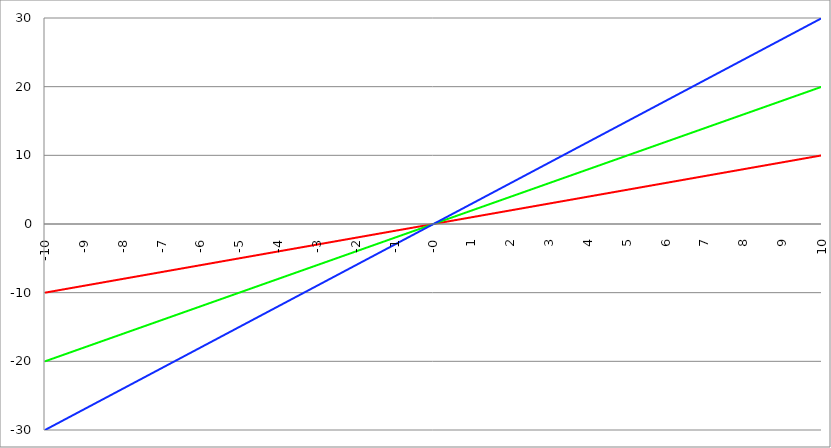
| Category | Series 1 | Series 0 | Series 2 |
|---|---|---|---|
| -10.0 | -10 | -20 | -30 |
| -9.99 | -9.99 | -19.98 | -29.97 |
| -9.98 | -9.98 | -19.96 | -29.94 |
| -9.97 | -9.97 | -19.94 | -29.91 |
| -9.96 | -9.96 | -19.92 | -29.88 |
| -9.95 | -9.95 | -19.9 | -29.85 |
| -9.940000000000001 | -9.94 | -19.88 | -29.82 |
| -9.930000000000001 | -9.93 | -19.86 | -29.79 |
| -9.920000000000002 | -9.92 | -19.84 | -29.76 |
| -9.91 | -9.91 | -19.82 | -29.73 |
| -9.900000000000002 | -9.9 | -19.8 | -29.7 |
| -9.890000000000002 | -9.89 | -19.78 | -29.67 |
| -9.880000000000003 | -9.88 | -19.76 | -29.64 |
| -9.870000000000003 | -9.87 | -19.74 | -29.61 |
| -9.860000000000001 | -9.86 | -19.72 | -29.58 |
| -9.850000000000003 | -9.85 | -19.7 | -29.55 |
| -9.840000000000003 | -9.84 | -19.68 | -29.52 |
| -9.830000000000004 | -9.83 | -19.66 | -29.49 |
| -9.820000000000004 | -9.82 | -19.64 | -29.46 |
| -9.810000000000004 | -9.81 | -19.62 | -29.43 |
| -9.800000000000004 | -9.8 | -19.6 | -29.4 |
| -9.790000000000004 | -9.79 | -19.58 | -29.37 |
| -9.780000000000005 | -9.78 | -19.56 | -29.34 |
| -9.770000000000005 | -9.77 | -19.54 | -29.31 |
| -9.760000000000005 | -9.76 | -19.52 | -29.28 |
| -9.750000000000005 | -9.75 | -19.5 | -29.25 |
| -9.740000000000006 | -9.74 | -19.48 | -29.22 |
| -9.730000000000006 | -9.73 | -19.46 | -29.19 |
| -9.720000000000006 | -9.72 | -19.44 | -29.16 |
| -9.710000000000006 | -9.71 | -19.42 | -29.13 |
| -9.700000000000006 | -9.7 | -19.4 | -29.1 |
| -9.690000000000007 | -9.69 | -19.38 | -29.07 |
| -9.680000000000007 | -9.68 | -19.36 | -29.04 |
| -9.670000000000007 | -9.67 | -19.34 | -29.01 |
| -9.660000000000007 | -9.66 | -19.32 | -28.98 |
| -9.650000000000007 | -9.65 | -19.3 | -28.95 |
| -9.640000000000008 | -9.64 | -19.28 | -28.92 |
| -9.630000000000008 | -9.63 | -19.26 | -28.89 |
| -9.620000000000008 | -9.62 | -19.24 | -28.86 |
| -9.610000000000008 | -9.61 | -19.22 | -28.83 |
| -9.600000000000009 | -9.6 | -19.2 | -28.8 |
| -9.590000000000009 | -9.59 | -19.18 | -28.77 |
| -9.580000000000007 | -9.58 | -19.16 | -28.74 |
| -9.57000000000001 | -9.57 | -19.14 | -28.71 |
| -9.56000000000001 | -9.56 | -19.12 | -28.68 |
| -9.55000000000001 | -9.55 | -19.1 | -28.65 |
| -9.54000000000001 | -9.54 | -19.08 | -28.62 |
| -9.53000000000001 | -9.53 | -19.06 | -28.59 |
| -9.52000000000001 | -9.52 | -19.04 | -28.56 |
| -9.51000000000001 | -9.51 | -19.02 | -28.53 |
| -9.50000000000001 | -9.5 | -19 | -28.5 |
| -9.49000000000001 | -9.49 | -18.98 | -28.47 |
| -9.48000000000001 | -9.48 | -18.96 | -28.44 |
| -9.47000000000001 | -9.47 | -18.94 | -28.41 |
| -9.46000000000001 | -9.46 | -18.92 | -28.38 |
| -9.45000000000001 | -9.45 | -18.9 | -28.35 |
| -9.44000000000001 | -9.44 | -18.88 | -28.32 |
| -9.430000000000012 | -9.43 | -18.86 | -28.29 |
| -9.420000000000012 | -9.42 | -18.84 | -28.26 |
| -9.410000000000013 | -9.41 | -18.82 | -28.23 |
| -9.400000000000013 | -9.4 | -18.8 | -28.2 |
| -9.390000000000011 | -9.39 | -18.78 | -28.17 |
| -9.380000000000013 | -9.38 | -18.76 | -28.14 |
| -9.370000000000013 | -9.37 | -18.74 | -28.11 |
| -9.360000000000014 | -9.36 | -18.72 | -28.08 |
| -9.350000000000014 | -9.35 | -18.7 | -28.05 |
| -9.340000000000014 | -9.34 | -18.68 | -28.02 |
| -9.330000000000014 | -9.33 | -18.66 | -27.99 |
| -9.320000000000014 | -9.32 | -18.64 | -27.96 |
| -9.310000000000015 | -9.31 | -18.62 | -27.93 |
| -9.300000000000013 | -9.3 | -18.6 | -27.9 |
| -9.290000000000015 | -9.29 | -18.58 | -27.87 |
| -9.280000000000015 | -9.28 | -18.56 | -27.84 |
| -9.270000000000016 | -9.27 | -18.54 | -27.81 |
| -9.260000000000016 | -9.26 | -18.52 | -27.78 |
| -9.250000000000014 | -9.25 | -18.5 | -27.75 |
| -9.240000000000016 | -9.24 | -18.48 | -27.72 |
| -9.230000000000016 | -9.23 | -18.46 | -27.69 |
| -9.220000000000017 | -9.22 | -18.44 | -27.66 |
| -9.210000000000017 | -9.21 | -18.42 | -27.63 |
| -9.200000000000017 | -9.2 | -18.4 | -27.6 |
| -9.190000000000017 | -9.19 | -18.38 | -27.57 |
| -9.180000000000017 | -9.18 | -18.36 | -27.54 |
| -9.170000000000018 | -9.17 | -18.34 | -27.51 |
| -9.160000000000016 | -9.16 | -18.32 | -27.48 |
| -9.150000000000018 | -9.15 | -18.3 | -27.45 |
| -9.140000000000018 | -9.14 | -18.28 | -27.42 |
| -9.130000000000019 | -9.13 | -18.26 | -27.39 |
| -9.120000000000019 | -9.12 | -18.24 | -27.36 |
| -9.110000000000017 | -9.11 | -18.22 | -27.33 |
| -9.10000000000002 | -9.1 | -18.2 | -27.3 |
| -9.09000000000002 | -9.09 | -18.18 | -27.27 |
| -9.08000000000002 | -9.08 | -18.16 | -27.24 |
| -9.07000000000002 | -9.07 | -18.14 | -27.21 |
| -9.06000000000002 | -9.06 | -18.12 | -27.18 |
| -9.05000000000002 | -9.05 | -18.1 | -27.15 |
| -9.04000000000002 | -9.04 | -18.08 | -27.12 |
| -9.03000000000002 | -9.03 | -18.06 | -27.09 |
| -9.020000000000021 | -9.02 | -18.04 | -27.06 |
| -9.010000000000021 | -9.01 | -18.02 | -27.03 |
| -9.000000000000021 | -9 | -18 | -27 |
| -8.990000000000022 | -8.99 | -17.98 | -26.97 |
| -8.980000000000022 | -8.98 | -17.96 | -26.94 |
| -8.97000000000002 | -8.97 | -17.94 | -26.91 |
| -8.960000000000022 | -8.96 | -17.92 | -26.88 |
| -8.950000000000022 | -8.95 | -17.9 | -26.85 |
| -8.940000000000023 | -8.94 | -17.88 | -26.82 |
| -8.930000000000023 | -8.93 | -17.86 | -26.79 |
| -8.920000000000023 | -8.92 | -17.84 | -26.76 |
| -8.910000000000023 | -8.91 | -17.82 | -26.73 |
| -8.900000000000023 | -8.9 | -17.8 | -26.7 |
| -8.890000000000024 | -8.89 | -17.78 | -26.67 |
| -8.880000000000024 | -8.88 | -17.76 | -26.64 |
| -8.870000000000024 | -8.87 | -17.74 | -26.61 |
| -8.860000000000024 | -8.86 | -17.72 | -26.58 |
| -8.850000000000025 | -8.85 | -17.7 | -26.55 |
| -8.840000000000025 | -8.84 | -17.68 | -26.52 |
| -8.830000000000025 | -8.83 | -17.66 | -26.49 |
| -8.820000000000025 | -8.82 | -17.64 | -26.46 |
| -8.810000000000025 | -8.81 | -17.62 | -26.43 |
| -8.800000000000026 | -8.8 | -17.6 | -26.4 |
| -8.790000000000026 | -8.79 | -17.58 | -26.37 |
| -8.780000000000026 | -8.78 | -17.56 | -26.34 |
| -8.770000000000026 | -8.77 | -17.54 | -26.31 |
| -8.760000000000026 | -8.76 | -17.52 | -26.28 |
| -8.750000000000027 | -8.75 | -17.5 | -26.25 |
| -8.740000000000027 | -8.74 | -17.48 | -26.22 |
| -8.730000000000027 | -8.73 | -17.46 | -26.19 |
| -8.720000000000027 | -8.72 | -17.44 | -26.16 |
| -8.710000000000027 | -8.71 | -17.42 | -26.13 |
| -8.700000000000028 | -8.7 | -17.4 | -26.1 |
| -8.690000000000028 | -8.69 | -17.38 | -26.07 |
| -8.680000000000028 | -8.68 | -17.36 | -26.04 |
| -8.670000000000028 | -8.67 | -17.34 | -26.01 |
| -8.660000000000029 | -8.66 | -17.32 | -25.98 |
| -8.650000000000029 | -8.65 | -17.3 | -25.95 |
| -8.640000000000029 | -8.64 | -17.28 | -25.92 |
| -8.63000000000003 | -8.63 | -17.26 | -25.89 |
| -8.62000000000003 | -8.62 | -17.24 | -25.86 |
| -8.61000000000003 | -8.61 | -17.22 | -25.83 |
| -8.60000000000003 | -8.6 | -17.2 | -25.8 |
| -8.59000000000003 | -8.59 | -17.18 | -25.77 |
| -8.58000000000003 | -8.58 | -17.16 | -25.74 |
| -8.57000000000003 | -8.57 | -17.14 | -25.71 |
| -8.56000000000003 | -8.56 | -17.12 | -25.68 |
| -8.55000000000003 | -8.55 | -17.1 | -25.65 |
| -8.540000000000031 | -8.54 | -17.08 | -25.62 |
| -8.530000000000031 | -8.53 | -17.06 | -25.59 |
| -8.520000000000032 | -8.52 | -17.04 | -25.56 |
| -8.510000000000032 | -8.51 | -17.02 | -25.53 |
| -8.50000000000003 | -8.5 | -17 | -25.5 |
| -8.490000000000032 | -8.49 | -16.98 | -25.47 |
| -8.480000000000032 | -8.48 | -16.96 | -25.44 |
| -8.470000000000033 | -8.47 | -16.94 | -25.41 |
| -8.460000000000033 | -8.46 | -16.92 | -25.38 |
| -8.450000000000033 | -8.45 | -16.9 | -25.35 |
| -8.440000000000033 | -8.44 | -16.88 | -25.32 |
| -8.430000000000033 | -8.43 | -16.86 | -25.29 |
| -8.420000000000034 | -8.42 | -16.84 | -25.26 |
| -8.410000000000032 | -8.41 | -16.82 | -25.23 |
| -8.400000000000034 | -8.4 | -16.8 | -25.2 |
| -8.390000000000034 | -8.39 | -16.78 | -25.17 |
| -8.380000000000035 | -8.38 | -16.76 | -25.14 |
| -8.370000000000035 | -8.37 | -16.74 | -25.11 |
| -8.360000000000033 | -8.36 | -16.72 | -25.08 |
| -8.350000000000035 | -8.35 | -16.7 | -25.05 |
| -8.340000000000035 | -8.34 | -16.68 | -25.02 |
| -8.330000000000036 | -8.33 | -16.66 | -24.99 |
| -8.320000000000036 | -8.32 | -16.64 | -24.96 |
| -8.310000000000034 | -8.31 | -16.62 | -24.93 |
| -8.300000000000036 | -8.3 | -16.6 | -24.9 |
| -8.290000000000036 | -8.29 | -16.58 | -24.87 |
| -8.280000000000037 | -8.28 | -16.56 | -24.84 |
| -8.270000000000037 | -8.27 | -16.54 | -24.81 |
| -8.260000000000037 | -8.26 | -16.52 | -24.78 |
| -8.250000000000037 | -8.25 | -16.5 | -24.75 |
| -8.240000000000038 | -8.24 | -16.48 | -24.72 |
| -8.230000000000038 | -8.23 | -16.46 | -24.69 |
| -8.220000000000038 | -8.22 | -16.44 | -24.66 |
| -8.210000000000038 | -8.21 | -16.42 | -24.63 |
| -8.200000000000038 | -8.2 | -16.4 | -24.6 |
| -8.190000000000039 | -8.19 | -16.38 | -24.57 |
| -8.180000000000039 | -8.18 | -16.36 | -24.54 |
| -8.170000000000037 | -8.17 | -16.34 | -24.51 |
| -8.16000000000004 | -8.16 | -16.32 | -24.48 |
| -8.15000000000004 | -8.15 | -16.3 | -24.45 |
| -8.14000000000004 | -8.14 | -16.28 | -24.42 |
| -8.13000000000004 | -8.13 | -16.26 | -24.39 |
| -8.12000000000004 | -8.12 | -16.24 | -24.36 |
| -8.11000000000004 | -8.11 | -16.22 | -24.33 |
| -8.10000000000004 | -8.1 | -16.2 | -24.3 |
| -8.09000000000004 | -8.09 | -16.18 | -24.27 |
| -8.08000000000004 | -8.08 | -16.16 | -24.24 |
| -8.07000000000004 | -8.07 | -16.14 | -24.21 |
| -8.06000000000004 | -8.06 | -16.12 | -24.18 |
| -8.05000000000004 | -8.05 | -16.1 | -24.15 |
| -8.040000000000042 | -8.04 | -16.08 | -24.12 |
| -8.03000000000004 | -8.03 | -16.06 | -24.09 |
| -8.020000000000042 | -8.02 | -16.04 | -24.06 |
| -8.010000000000042 | -8.01 | -16.02 | -24.03 |
| -8.000000000000043 | -8 | -16 | -24 |
| -7.990000000000043 | -7.99 | -15.98 | -23.97 |
| -7.980000000000043 | -7.98 | -15.96 | -23.94 |
| -7.970000000000043 | -7.97 | -15.94 | -23.91 |
| -7.960000000000043 | -7.96 | -15.92 | -23.88 |
| -7.950000000000044 | -7.95 | -15.9 | -23.85 |
| -7.940000000000044 | -7.94 | -15.88 | -23.82 |
| -7.930000000000044 | -7.93 | -15.86 | -23.79 |
| -7.920000000000044 | -7.92 | -15.84 | -23.76 |
| -7.910000000000044 | -7.91 | -15.82 | -23.73 |
| -7.900000000000044 | -7.9 | -15.8 | -23.7 |
| -7.890000000000045 | -7.89 | -15.78 | -23.67 |
| -7.880000000000045 | -7.88 | -15.76 | -23.64 |
| -7.870000000000045 | -7.87 | -15.74 | -23.61 |
| -7.860000000000046 | -7.86 | -15.72 | -23.58 |
| -7.850000000000046 | -7.85 | -15.7 | -23.55 |
| -7.840000000000046 | -7.84 | -15.68 | -23.52 |
| -7.830000000000046 | -7.83 | -15.66 | -23.49 |
| -7.820000000000046 | -7.82 | -15.64 | -23.46 |
| -7.810000000000047 | -7.81 | -15.62 | -23.43 |
| -7.800000000000047 | -7.8 | -15.6 | -23.4 |
| -7.790000000000047 | -7.79 | -15.58 | -23.37 |
| -7.780000000000047 | -7.78 | -15.56 | -23.34 |
| -7.770000000000047 | -7.77 | -15.54 | -23.31 |
| -7.760000000000048 | -7.76 | -15.52 | -23.28 |
| -7.750000000000048 | -7.75 | -15.5 | -23.25 |
| -7.740000000000048 | -7.74 | -15.48 | -23.22 |
| -7.730000000000048 | -7.73 | -15.46 | -23.19 |
| -7.720000000000049 | -7.72 | -15.44 | -23.16 |
| -7.710000000000049 | -7.71 | -15.42 | -23.13 |
| -7.700000000000049 | -7.7 | -15.4 | -23.1 |
| -7.690000000000049 | -7.69 | -15.38 | -23.07 |
| -7.680000000000049 | -7.68 | -15.36 | -23.04 |
| -7.67000000000005 | -7.67 | -15.34 | -23.01 |
| -7.66000000000005 | -7.66 | -15.32 | -22.98 |
| -7.65000000000005 | -7.65 | -15.3 | -22.95 |
| -7.64000000000005 | -7.64 | -15.28 | -22.92 |
| -7.63000000000005 | -7.63 | -15.26 | -22.89 |
| -7.620000000000051 | -7.62 | -15.24 | -22.86 |
| -7.610000000000051 | -7.61 | -15.22 | -22.83 |
| -7.600000000000051 | -7.6 | -15.2 | -22.8 |
| -7.590000000000051 | -7.59 | -15.18 | -22.77 |
| -7.580000000000052 | -7.58 | -15.16 | -22.74 |
| -7.570000000000052 | -7.57 | -15.14 | -22.71 |
| -7.560000000000052 | -7.56 | -15.12 | -22.68 |
| -7.550000000000052 | -7.55 | -15.1 | -22.65 |
| -7.540000000000052 | -7.54 | -15.08 | -22.62 |
| -7.530000000000053 | -7.53 | -15.06 | -22.59 |
| -7.520000000000053 | -7.52 | -15.04 | -22.56 |
| -7.510000000000053 | -7.51 | -15.02 | -22.53 |
| -7.500000000000053 | -7.5 | -15 | -22.5 |
| -7.490000000000053 | -7.49 | -14.98 | -22.47 |
| -7.480000000000054 | -7.48 | -14.96 | -22.44 |
| -7.470000000000054 | -7.47 | -14.94 | -22.41 |
| -7.460000000000054 | -7.46 | -14.92 | -22.38 |
| -7.450000000000054 | -7.45 | -14.9 | -22.35 |
| -7.440000000000054 | -7.44 | -14.88 | -22.32 |
| -7.430000000000054 | -7.43 | -14.86 | -22.29 |
| -7.420000000000055 | -7.42 | -14.84 | -22.26 |
| -7.410000000000055 | -7.41 | -14.82 | -22.23 |
| -7.400000000000055 | -7.4 | -14.8 | -22.2 |
| -7.390000000000056 | -7.39 | -14.78 | -22.17 |
| -7.380000000000056 | -7.38 | -14.76 | -22.14 |
| -7.370000000000056 | -7.37 | -14.74 | -22.11 |
| -7.360000000000056 | -7.36 | -14.72 | -22.08 |
| -7.350000000000056 | -7.35 | -14.7 | -22.05 |
| -7.340000000000057 | -7.34 | -14.68 | -22.02 |
| -7.330000000000057 | -7.33 | -14.66 | -21.99 |
| -7.320000000000057 | -7.32 | -14.64 | -21.96 |
| -7.310000000000057 | -7.31 | -14.62 | -21.93 |
| -7.300000000000058 | -7.3 | -14.6 | -21.9 |
| -7.290000000000058 | -7.29 | -14.58 | -21.87 |
| -7.280000000000058 | -7.28 | -14.56 | -21.84 |
| -7.270000000000058 | -7.27 | -14.54 | -21.81 |
| -7.260000000000058 | -7.26 | -14.52 | -21.78 |
| -7.250000000000059 | -7.25 | -14.5 | -21.75 |
| -7.240000000000059 | -7.24 | -14.48 | -21.72 |
| -7.23000000000006 | -7.23 | -14.46 | -21.69 |
| -7.220000000000059 | -7.22 | -14.44 | -21.66 |
| -7.210000000000059 | -7.21 | -14.42 | -21.63 |
| -7.20000000000006 | -7.2 | -14.4 | -21.6 |
| -7.19000000000006 | -7.19 | -14.38 | -21.57 |
| -7.18000000000006 | -7.18 | -14.36 | -21.54 |
| -7.17000000000006 | -7.17 | -14.34 | -21.51 |
| -7.160000000000061 | -7.16 | -14.32 | -21.48 |
| -7.150000000000061 | -7.15 | -14.3 | -21.45 |
| -7.140000000000061 | -7.14 | -14.28 | -21.42 |
| -7.130000000000061 | -7.13 | -14.26 | -21.39 |
| -7.120000000000061 | -7.12 | -14.24 | -21.36 |
| -7.110000000000062 | -7.11 | -14.22 | -21.33 |
| -7.100000000000062 | -7.1 | -14.2 | -21.3 |
| -7.090000000000062 | -7.09 | -14.18 | -21.27 |
| -7.080000000000062 | -7.08 | -14.16 | -21.24 |
| -7.070000000000062 | -7.07 | -14.14 | -21.21 |
| -7.060000000000063 | -7.06 | -14.12 | -21.18 |
| -7.050000000000063 | -7.05 | -14.1 | -21.15 |
| -7.040000000000063 | -7.04 | -14.08 | -21.12 |
| -7.030000000000063 | -7.03 | -14.06 | -21.09 |
| -7.020000000000064 | -7.02 | -14.04 | -21.06 |
| -7.010000000000064 | -7.01 | -14.02 | -21.03 |
| -7.000000000000064 | -7 | -14 | -21 |
| -6.990000000000064 | -6.99 | -13.98 | -20.97 |
| -6.980000000000064 | -6.98 | -13.96 | -20.94 |
| -6.970000000000064 | -6.97 | -13.94 | -20.91 |
| -6.960000000000064 | -6.96 | -13.92 | -20.88 |
| -6.950000000000064 | -6.95 | -13.9 | -20.85 |
| -6.940000000000065 | -6.94 | -13.88 | -20.82 |
| -6.930000000000065 | -6.93 | -13.86 | -20.79 |
| -6.920000000000065 | -6.92 | -13.84 | -20.76 |
| -6.910000000000065 | -6.91 | -13.82 | -20.73 |
| -6.900000000000066 | -6.9 | -13.8 | -20.7 |
| -6.890000000000066 | -6.89 | -13.78 | -20.67 |
| -6.880000000000066 | -6.88 | -13.76 | -20.64 |
| -6.870000000000066 | -6.87 | -13.74 | -20.61 |
| -6.860000000000067 | -6.86 | -13.72 | -20.58 |
| -6.850000000000067 | -6.85 | -13.7 | -20.55 |
| -6.840000000000067 | -6.84 | -13.68 | -20.52 |
| -6.830000000000067 | -6.83 | -13.66 | -20.49 |
| -6.820000000000068 | -6.82 | -13.64 | -20.46 |
| -6.810000000000068 | -6.81 | -13.62 | -20.43 |
| -6.800000000000068 | -6.8 | -13.6 | -20.4 |
| -6.790000000000068 | -6.79 | -13.58 | -20.37 |
| -6.780000000000068 | -6.78 | -13.56 | -20.34 |
| -6.770000000000068 | -6.77 | -13.54 | -20.31 |
| -6.760000000000069 | -6.76 | -13.52 | -20.28 |
| -6.75000000000007 | -6.75 | -13.5 | -20.25 |
| -6.74000000000007 | -6.74 | -13.48 | -20.22 |
| -6.73000000000007 | -6.73 | -13.46 | -20.19 |
| -6.72000000000007 | -6.72 | -13.44 | -20.16 |
| -6.71000000000007 | -6.71 | -13.42 | -20.13 |
| -6.70000000000007 | -6.7 | -13.4 | -20.1 |
| -6.69000000000007 | -6.69 | -13.38 | -20.07 |
| -6.680000000000071 | -6.68 | -13.36 | -20.04 |
| -6.670000000000071 | -6.67 | -13.34 | -20.01 |
| -6.660000000000071 | -6.66 | -13.32 | -19.98 |
| -6.650000000000071 | -6.65 | -13.3 | -19.95 |
| -6.640000000000072 | -6.64 | -13.28 | -19.92 |
| -6.630000000000072 | -6.63 | -13.26 | -19.89 |
| -6.620000000000072 | -6.62 | -13.24 | -19.86 |
| -6.610000000000072 | -6.61 | -13.22 | -19.83 |
| -6.600000000000072 | -6.6 | -13.2 | -19.8 |
| -6.590000000000073 | -6.59 | -13.18 | -19.77 |
| -6.580000000000073 | -6.58 | -13.16 | -19.74 |
| -6.570000000000073 | -6.57 | -13.14 | -19.71 |
| -6.560000000000073 | -6.56 | -13.12 | -19.68 |
| -6.550000000000074 | -6.55 | -13.1 | -19.65 |
| -6.540000000000074 | -6.54 | -13.08 | -19.62 |
| -6.530000000000074 | -6.53 | -13.06 | -19.59 |
| -6.520000000000074 | -6.52 | -13.04 | -19.56 |
| -6.510000000000074 | -6.51 | -13.02 | -19.53 |
| -6.500000000000074 | -6.5 | -13 | -19.5 |
| -6.490000000000074 | -6.49 | -12.98 | -19.47 |
| -6.480000000000074 | -6.48 | -12.96 | -19.44 |
| -6.470000000000075 | -6.47 | -12.94 | -19.41 |
| -6.460000000000075 | -6.46 | -12.92 | -19.38 |
| -6.450000000000075 | -6.45 | -12.9 | -19.35 |
| -6.440000000000075 | -6.44 | -12.88 | -19.32 |
| -6.430000000000076 | -6.43 | -12.86 | -19.29 |
| -6.420000000000076 | -6.42 | -12.84 | -19.26 |
| -6.410000000000076 | -6.41 | -12.82 | -19.23 |
| -6.400000000000076 | -6.4 | -12.8 | -19.2 |
| -6.390000000000077 | -6.39 | -12.78 | -19.17 |
| -6.380000000000077 | -6.38 | -12.76 | -19.14 |
| -6.370000000000077 | -6.37 | -12.74 | -19.11 |
| -6.360000000000078 | -6.36 | -12.72 | -19.08 |
| -6.350000000000078 | -6.35 | -12.7 | -19.05 |
| -6.340000000000078 | -6.34 | -12.68 | -19.02 |
| -6.330000000000078 | -6.33 | -12.66 | -18.99 |
| -6.320000000000078 | -6.32 | -12.64 | -18.96 |
| -6.310000000000079 | -6.31 | -12.62 | -18.93 |
| -6.300000000000079 | -6.3 | -12.6 | -18.9 |
| -6.29000000000008 | -6.29 | -12.58 | -18.87 |
| -6.28000000000008 | -6.28 | -12.56 | -18.84 |
| -6.27000000000008 | -6.27 | -12.54 | -18.81 |
| -6.26000000000008 | -6.26 | -12.52 | -18.78 |
| -6.25000000000008 | -6.25 | -12.5 | -18.75 |
| -6.24000000000008 | -6.24 | -12.48 | -18.72 |
| -6.23000000000008 | -6.23 | -12.46 | -18.69 |
| -6.220000000000081 | -6.22 | -12.44 | -18.66 |
| -6.210000000000081 | -6.21 | -12.42 | -18.63 |
| -6.200000000000081 | -6.2 | -12.4 | -18.6 |
| -6.190000000000081 | -6.19 | -12.38 | -18.57 |
| -6.180000000000081 | -6.18 | -12.36 | -18.54 |
| -6.170000000000082 | -6.17 | -12.34 | -18.51 |
| -6.160000000000082 | -6.16 | -12.32 | -18.48 |
| -6.150000000000082 | -6.15 | -12.3 | -18.45 |
| -6.140000000000082 | -6.14 | -12.28 | -18.42 |
| -6.130000000000082 | -6.13 | -12.26 | -18.39 |
| -6.120000000000083 | -6.12 | -12.24 | -18.36 |
| -6.110000000000083 | -6.11 | -12.22 | -18.33 |
| -6.100000000000083 | -6.1 | -12.2 | -18.3 |
| -6.090000000000083 | -6.09 | -12.18 | -18.27 |
| -6.080000000000084 | -6.08 | -12.16 | -18.24 |
| -6.070000000000084 | -6.07 | -12.14 | -18.21 |
| -6.060000000000084 | -6.06 | -12.12 | -18.18 |
| -6.050000000000084 | -6.05 | -12.1 | -18.15 |
| -6.040000000000084 | -6.04 | -12.08 | -18.12 |
| -6.030000000000084 | -6.03 | -12.06 | -18.09 |
| -6.020000000000085 | -6.02 | -12.04 | -18.06 |
| -6.010000000000085 | -6.01 | -12.02 | -18.03 |
| -6.000000000000085 | -6 | -12 | -18 |
| -5.990000000000085 | -5.99 | -11.98 | -17.97 |
| -5.980000000000085 | -5.98 | -11.96 | -17.94 |
| -5.970000000000085 | -5.97 | -11.94 | -17.91 |
| -5.960000000000086 | -5.96 | -11.92 | -17.88 |
| -5.950000000000086 | -5.95 | -11.9 | -17.85 |
| -5.940000000000086 | -5.94 | -11.88 | -17.82 |
| -5.930000000000086 | -5.93 | -11.86 | -17.79 |
| -5.920000000000087 | -5.92 | -11.84 | -17.76 |
| -5.910000000000087 | -5.91 | -11.82 | -17.73 |
| -5.900000000000087 | -5.9 | -11.8 | -17.7 |
| -5.890000000000088 | -5.89 | -11.78 | -17.67 |
| -5.880000000000088 | -5.88 | -11.76 | -17.64 |
| -5.870000000000088 | -5.87 | -11.74 | -17.61 |
| -5.860000000000088 | -5.86 | -11.72 | -17.58 |
| -5.850000000000088 | -5.85 | -11.7 | -17.55 |
| -5.840000000000089 | -5.84 | -11.68 | -17.52 |
| -5.830000000000089 | -5.83 | -11.66 | -17.49 |
| -5.820000000000089 | -5.82 | -11.64 | -17.46 |
| -5.810000000000089 | -5.81 | -11.62 | -17.43 |
| -5.800000000000089 | -5.8 | -11.6 | -17.4 |
| -5.79000000000009 | -5.79 | -11.58 | -17.37 |
| -5.78000000000009 | -5.78 | -11.56 | -17.34 |
| -5.77000000000009 | -5.77 | -11.54 | -17.31 |
| -5.76000000000009 | -5.76 | -11.52 | -17.28 |
| -5.750000000000091 | -5.75 | -11.5 | -17.25 |
| -5.740000000000091 | -5.74 | -11.48 | -17.22 |
| -5.730000000000091 | -5.73 | -11.46 | -17.19 |
| -5.720000000000091 | -5.72 | -11.44 | -17.16 |
| -5.710000000000091 | -5.71 | -11.42 | -17.13 |
| -5.700000000000092 | -5.7 | -11.4 | -17.1 |
| -5.690000000000092 | -5.69 | -11.38 | -17.07 |
| -5.680000000000092 | -5.68 | -11.36 | -17.04 |
| -5.670000000000092 | -5.67 | -11.34 | -17.01 |
| -5.660000000000092 | -5.66 | -11.32 | -16.98 |
| -5.650000000000093 | -5.65 | -11.3 | -16.95 |
| -5.640000000000093 | -5.64 | -11.28 | -16.92 |
| -5.630000000000093 | -5.63 | -11.26 | -16.89 |
| -5.620000000000093 | -5.62 | -11.24 | -16.86 |
| -5.610000000000093 | -5.61 | -11.22 | -16.83 |
| -5.600000000000094 | -5.6 | -11.2 | -16.8 |
| -5.590000000000094 | -5.59 | -11.18 | -16.77 |
| -5.580000000000094 | -5.58 | -11.16 | -16.74 |
| -5.570000000000094 | -5.57 | -11.14 | -16.71 |
| -5.560000000000095 | -5.56 | -11.12 | -16.68 |
| -5.550000000000095 | -5.55 | -11.1 | -16.65 |
| -5.540000000000095 | -5.54 | -11.08 | -16.62 |
| -5.530000000000095 | -5.53 | -11.06 | -16.59 |
| -5.520000000000095 | -5.52 | -11.04 | -16.56 |
| -5.510000000000096 | -5.51 | -11.02 | -16.53 |
| -5.500000000000096 | -5.5 | -11 | -16.5 |
| -5.490000000000096 | -5.49 | -10.98 | -16.47 |
| -5.480000000000096 | -5.48 | -10.96 | -16.44 |
| -5.470000000000096 | -5.47 | -10.94 | -16.41 |
| -5.460000000000097 | -5.46 | -10.92 | -16.38 |
| -5.450000000000097 | -5.45 | -10.9 | -16.35 |
| -5.440000000000097 | -5.44 | -10.88 | -16.32 |
| -5.430000000000097 | -5.43 | -10.86 | -16.29 |
| -5.420000000000098 | -5.42 | -10.84 | -16.26 |
| -5.410000000000098 | -5.41 | -10.82 | -16.23 |
| -5.400000000000098 | -5.4 | -10.8 | -16.2 |
| -5.390000000000098 | -5.39 | -10.78 | -16.17 |
| -5.380000000000098 | -5.38 | -10.76 | -16.14 |
| -5.370000000000099 | -5.37 | -10.74 | -16.11 |
| -5.360000000000099 | -5.36 | -10.72 | -16.08 |
| -5.350000000000099 | -5.35 | -10.7 | -16.05 |
| -5.340000000000099 | -5.34 | -10.68 | -16.02 |
| -5.330000000000099 | -5.33 | -10.66 | -15.99 |
| -5.3200000000001 | -5.32 | -10.64 | -15.96 |
| -5.3100000000001 | -5.31 | -10.62 | -15.93 |
| -5.3000000000001 | -5.3 | -10.6 | -15.9 |
| -5.2900000000001 | -5.29 | -10.58 | -15.87 |
| -5.2800000000001 | -5.28 | -10.56 | -15.84 |
| -5.2700000000001 | -5.27 | -10.54 | -15.81 |
| -5.260000000000101 | -5.26 | -10.52 | -15.78 |
| -5.250000000000101 | -5.25 | -10.5 | -15.75 |
| -5.240000000000101 | -5.24 | -10.48 | -15.72 |
| -5.230000000000101 | -5.23 | -10.46 | -15.69 |
| -5.220000000000102 | -5.22 | -10.44 | -15.66 |
| -5.210000000000102 | -5.21 | -10.42 | -15.63 |
| -5.200000000000102 | -5.2 | -10.4 | -15.6 |
| -5.190000000000103 | -5.19 | -10.38 | -15.57 |
| -5.180000000000103 | -5.18 | -10.36 | -15.54 |
| -5.170000000000103 | -5.17 | -10.34 | -15.51 |
| -5.160000000000103 | -5.16 | -10.32 | -15.48 |
| -5.150000000000103 | -5.15 | -10.3 | -15.45 |
| -5.140000000000104 | -5.14 | -10.28 | -15.42 |
| -5.130000000000104 | -5.13 | -10.26 | -15.39 |
| -5.120000000000104 | -5.12 | -10.24 | -15.36 |
| -5.110000000000104 | -5.11 | -10.22 | -15.33 |
| -5.100000000000104 | -5.1 | -10.2 | -15.3 |
| -5.090000000000104 | -5.09 | -10.18 | -15.27 |
| -5.080000000000104 | -5.08 | -10.16 | -15.24 |
| -5.070000000000105 | -5.07 | -10.14 | -15.21 |
| -5.060000000000105 | -5.06 | -10.12 | -15.18 |
| -5.050000000000105 | -5.05 | -10.1 | -15.15 |
| -5.040000000000105 | -5.04 | -10.08 | -15.12 |
| -5.030000000000105 | -5.03 | -10.06 | -15.09 |
| -5.020000000000106 | -5.02 | -10.04 | -15.06 |
| -5.010000000000106 | -5.01 | -10.02 | -15.03 |
| -5.000000000000106 | -5 | -10 | -15 |
| -4.990000000000106 | -4.99 | -9.98 | -14.97 |
| -4.980000000000106 | -4.98 | -9.96 | -14.94 |
| -4.970000000000107 | -4.97 | -9.94 | -14.91 |
| -4.960000000000107 | -4.96 | -9.92 | -14.88 |
| -4.950000000000107 | -4.95 | -9.9 | -14.85 |
| -4.940000000000107 | -4.94 | -9.88 | -14.82 |
| -4.930000000000108 | -4.93 | -9.86 | -14.79 |
| -4.920000000000108 | -4.92 | -9.84 | -14.76 |
| -4.910000000000108 | -4.91 | -9.82 | -14.73 |
| -4.900000000000108 | -4.9 | -9.8 | -14.7 |
| -4.890000000000109 | -4.89 | -9.78 | -14.67 |
| -4.88000000000011 | -4.88 | -9.76 | -14.64 |
| -4.87000000000011 | -4.87 | -9.74 | -14.61 |
| -4.86000000000011 | -4.86 | -9.72 | -14.58 |
| -4.85000000000011 | -4.85 | -9.7 | -14.55 |
| -4.84000000000011 | -4.84 | -9.68 | -14.52 |
| -4.83000000000011 | -4.83 | -9.66 | -14.49 |
| -4.82000000000011 | -4.82 | -9.64 | -14.46 |
| -4.810000000000111 | -4.81 | -9.62 | -14.43 |
| -4.800000000000111 | -4.8 | -9.6 | -14.4 |
| -4.790000000000111 | -4.79 | -9.58 | -14.37 |
| -4.780000000000111 | -4.78 | -9.56 | -14.34 |
| -4.770000000000111 | -4.77 | -9.54 | -14.31 |
| -4.760000000000112 | -4.76 | -9.52 | -14.28 |
| -4.750000000000112 | -4.75 | -9.5 | -14.25 |
| -4.740000000000112 | -4.74 | -9.48 | -14.22 |
| -4.730000000000112 | -4.73 | -9.46 | -14.19 |
| -4.720000000000112 | -4.72 | -9.44 | -14.16 |
| -4.710000000000113 | -4.71 | -9.42 | -14.13 |
| -4.700000000000113 | -4.7 | -9.4 | -14.1 |
| -4.690000000000113 | -4.69 | -9.38 | -14.07 |
| -4.680000000000113 | -4.68 | -9.36 | -14.04 |
| -4.670000000000114 | -4.67 | -9.34 | -14.01 |
| -4.660000000000114 | -4.66 | -9.32 | -13.98 |
| -4.650000000000114 | -4.65 | -9.3 | -13.95 |
| -4.640000000000114 | -4.64 | -9.28 | -13.92 |
| -4.630000000000114 | -4.63 | -9.26 | -13.89 |
| -4.620000000000115 | -4.62 | -9.24 | -13.86 |
| -4.610000000000115 | -4.61 | -9.22 | -13.83 |
| -4.600000000000115 | -4.6 | -9.2 | -13.8 |
| -4.590000000000115 | -4.59 | -9.18 | -13.77 |
| -4.580000000000115 | -4.58 | -9.16 | -13.74 |
| -4.570000000000115 | -4.57 | -9.14 | -13.71 |
| -4.560000000000116 | -4.56 | -9.12 | -13.68 |
| -4.550000000000116 | -4.55 | -9.1 | -13.65 |
| -4.540000000000116 | -4.54 | -9.08 | -13.62 |
| -4.530000000000116 | -4.53 | -9.06 | -13.59 |
| -4.520000000000117 | -4.52 | -9.04 | -13.56 |
| -4.510000000000117 | -4.51 | -9.02 | -13.53 |
| -4.500000000000117 | -4.5 | -9 | -13.5 |
| -4.490000000000117 | -4.49 | -8.98 | -13.47 |
| -4.480000000000117 | -4.48 | -8.96 | -13.44 |
| -4.470000000000117 | -4.47 | -8.94 | -13.41 |
| -4.460000000000118 | -4.46 | -8.92 | -13.38 |
| -4.450000000000118 | -4.45 | -8.9 | -13.35 |
| -4.440000000000118 | -4.44 | -8.88 | -13.32 |
| -4.430000000000118 | -4.43 | -8.86 | -13.29 |
| -4.420000000000119 | -4.42 | -8.84 | -13.26 |
| -4.41000000000012 | -4.41 | -8.82 | -13.23 |
| -4.40000000000012 | -4.4 | -8.8 | -13.2 |
| -4.39000000000012 | -4.39 | -8.78 | -13.17 |
| -4.38000000000012 | -4.38 | -8.76 | -13.14 |
| -4.37000000000012 | -4.37 | -8.74 | -13.11 |
| -4.36000000000012 | -4.36 | -8.72 | -13.08 |
| -4.35000000000012 | -4.35 | -8.7 | -13.05 |
| -4.34000000000012 | -4.34 | -8.68 | -13.02 |
| -4.33000000000012 | -4.33 | -8.66 | -12.99 |
| -4.320000000000121 | -4.32 | -8.64 | -12.96 |
| -4.310000000000121 | -4.31 | -8.62 | -12.93 |
| -4.300000000000121 | -4.3 | -8.6 | -12.9 |
| -4.290000000000121 | -4.29 | -8.58 | -12.87 |
| -4.280000000000121 | -4.28 | -8.56 | -12.84 |
| -4.270000000000122 | -4.27 | -8.54 | -12.81 |
| -4.260000000000122 | -4.26 | -8.52 | -12.78 |
| -4.250000000000122 | -4.25 | -8.5 | -12.75 |
| -4.240000000000122 | -4.24 | -8.48 | -12.72 |
| -4.230000000000122 | -4.23 | -8.46 | -12.69 |
| -4.220000000000123 | -4.22 | -8.44 | -12.66 |
| -4.210000000000123 | -4.21 | -8.42 | -12.63 |
| -4.200000000000123 | -4.2 | -8.4 | -12.6 |
| -4.190000000000124 | -4.19 | -8.38 | -12.57 |
| -4.180000000000124 | -4.18 | -8.36 | -12.54 |
| -4.170000000000124 | -4.17 | -8.34 | -12.51 |
| -4.160000000000124 | -4.16 | -8.32 | -12.48 |
| -4.150000000000124 | -4.15 | -8.3 | -12.45 |
| -4.140000000000124 | -4.14 | -8.28 | -12.42 |
| -4.130000000000125 | -4.13 | -8.26 | -12.39 |
| -4.120000000000125 | -4.12 | -8.24 | -12.36 |
| -4.110000000000125 | -4.11 | -8.22 | -12.33 |
| -4.100000000000125 | -4.1 | -8.2 | -12.3 |
| -4.090000000000125 | -4.09 | -8.18 | -12.27 |
| -4.080000000000126 | -4.08 | -8.16 | -12.24 |
| -4.070000000000126 | -4.07 | -8.14 | -12.21 |
| -4.060000000000126 | -4.06 | -8.12 | -12.18 |
| -4.050000000000126 | -4.05 | -8.1 | -12.15 |
| -4.040000000000127 | -4.04 | -8.08 | -12.12 |
| -4.030000000000127 | -4.03 | -8.06 | -12.09 |
| -4.020000000000127 | -4.02 | -8.04 | -12.06 |
| -4.010000000000127 | -4.01 | -8.02 | -12.03 |
| -4.000000000000127 | -4 | -8 | -12 |
| -3.990000000000128 | -3.99 | -7.98 | -11.97 |
| -3.980000000000128 | -3.98 | -7.96 | -11.94 |
| -3.970000000000129 | -3.97 | -7.94 | -11.91 |
| -3.960000000000129 | -3.96 | -7.92 | -11.88 |
| -3.950000000000129 | -3.95 | -7.9 | -11.85 |
| -3.940000000000129 | -3.94 | -7.88 | -11.82 |
| -3.930000000000129 | -3.93 | -7.86 | -11.79 |
| -3.92000000000013 | -3.92 | -7.84 | -11.76 |
| -3.91000000000013 | -3.91 | -7.82 | -11.73 |
| -3.90000000000013 | -3.9 | -7.8 | -11.7 |
| -3.89000000000013 | -3.89 | -7.78 | -11.67 |
| -3.88000000000013 | -3.88 | -7.76 | -11.64 |
| -3.870000000000131 | -3.87 | -7.74 | -11.61 |
| -3.860000000000131 | -3.86 | -7.72 | -11.58 |
| -3.850000000000131 | -3.85 | -7.7 | -11.55 |
| -3.840000000000131 | -3.84 | -7.68 | -11.52 |
| -3.830000000000131 | -3.83 | -7.66 | -11.49 |
| -3.820000000000132 | -3.82 | -7.64 | -11.46 |
| -3.810000000000132 | -3.81 | -7.62 | -11.43 |
| -3.800000000000132 | -3.8 | -7.6 | -11.4 |
| -3.790000000000132 | -3.79 | -7.58 | -11.37 |
| -3.780000000000132 | -3.78 | -7.56 | -11.34 |
| -3.770000000000133 | -3.77 | -7.54 | -11.31 |
| -3.760000000000133 | -3.76 | -7.52 | -11.28 |
| -3.750000000000133 | -3.75 | -7.5 | -11.25 |
| -3.740000000000133 | -3.74 | -7.48 | -11.22 |
| -3.730000000000134 | -3.73 | -7.46 | -11.19 |
| -3.720000000000134 | -3.72 | -7.44 | -11.16 |
| -3.710000000000134 | -3.71 | -7.42 | -11.13 |
| -3.700000000000134 | -3.7 | -7.4 | -11.1 |
| -3.690000000000134 | -3.69 | -7.38 | -11.07 |
| -3.680000000000135 | -3.68 | -7.36 | -11.04 |
| -3.670000000000135 | -3.67 | -7.34 | -11.01 |
| -3.660000000000135 | -3.66 | -7.32 | -10.98 |
| -3.650000000000135 | -3.65 | -7.3 | -10.95 |
| -3.640000000000135 | -3.64 | -7.28 | -10.92 |
| -3.630000000000136 | -3.63 | -7.26 | -10.89 |
| -3.620000000000136 | -3.62 | -7.24 | -10.86 |
| -3.610000000000136 | -3.61 | -7.22 | -10.83 |
| -3.600000000000136 | -3.6 | -7.2 | -10.8 |
| -3.590000000000137 | -3.59 | -7.18 | -10.77 |
| -3.580000000000137 | -3.58 | -7.16 | -10.74 |
| -3.570000000000137 | -3.57 | -7.14 | -10.71 |
| -3.560000000000137 | -3.56 | -7.12 | -10.68 |
| -3.550000000000137 | -3.55 | -7.1 | -10.65 |
| -3.540000000000138 | -3.54 | -7.08 | -10.62 |
| -3.530000000000138 | -3.53 | -7.06 | -10.59 |
| -3.520000000000138 | -3.52 | -7.04 | -10.56 |
| -3.510000000000138 | -3.51 | -7.02 | -10.53 |
| -3.500000000000139 | -3.5 | -7 | -10.5 |
| -3.490000000000139 | -3.49 | -6.98 | -10.47 |
| -3.480000000000139 | -3.48 | -6.96 | -10.44 |
| -3.470000000000139 | -3.47 | -6.94 | -10.41 |
| -3.460000000000139 | -3.46 | -6.92 | -10.38 |
| -3.45000000000014 | -3.45 | -6.9 | -10.35 |
| -3.44000000000014 | -3.44 | -6.88 | -10.32 |
| -3.43000000000014 | -3.43 | -6.86 | -10.29 |
| -3.42000000000014 | -3.42 | -6.84 | -10.26 |
| -3.41000000000014 | -3.41 | -6.82 | -10.23 |
| -3.400000000000141 | -3.4 | -6.8 | -10.2 |
| -3.390000000000141 | -3.39 | -6.78 | -10.17 |
| -3.380000000000141 | -3.38 | -6.76 | -10.14 |
| -3.370000000000141 | -3.37 | -6.74 | -10.11 |
| -3.360000000000141 | -3.36 | -6.72 | -10.08 |
| -3.350000000000142 | -3.35 | -6.7 | -10.05 |
| -3.340000000000142 | -3.34 | -6.68 | -10.02 |
| -3.330000000000142 | -3.33 | -6.66 | -9.99 |
| -3.320000000000142 | -3.32 | -6.64 | -9.96 |
| -3.310000000000143 | -3.31 | -6.62 | -9.93 |
| -3.300000000000143 | -3.3 | -6.6 | -9.9 |
| -3.290000000000143 | -3.29 | -6.58 | -9.87 |
| -3.280000000000143 | -3.28 | -6.56 | -9.84 |
| -3.270000000000143 | -3.27 | -6.54 | -9.81 |
| -3.260000000000144 | -3.26 | -6.52 | -9.78 |
| -3.250000000000144 | -3.25 | -6.5 | -9.75 |
| -3.240000000000144 | -3.24 | -6.48 | -9.72 |
| -3.230000000000144 | -3.23 | -6.46 | -9.69 |
| -3.220000000000145 | -3.22 | -6.44 | -9.66 |
| -3.210000000000145 | -3.21 | -6.42 | -9.63 |
| -3.200000000000145 | -3.2 | -6.4 | -9.6 |
| -3.190000000000145 | -3.19 | -6.38 | -9.57 |
| -3.180000000000145 | -3.18 | -6.36 | -9.54 |
| -3.170000000000146 | -3.17 | -6.34 | -9.51 |
| -3.160000000000146 | -3.16 | -6.32 | -9.48 |
| -3.150000000000146 | -3.15 | -6.3 | -9.45 |
| -3.140000000000146 | -3.14 | -6.28 | -9.42 |
| -3.130000000000146 | -3.13 | -6.26 | -9.39 |
| -3.120000000000147 | -3.12 | -6.24 | -9.36 |
| -3.110000000000147 | -3.11 | -6.22 | -9.33 |
| -3.100000000000147 | -3.1 | -6.2 | -9.3 |
| -3.090000000000147 | -3.09 | -6.18 | -9.27 |
| -3.080000000000147 | -3.08 | -6.16 | -9.24 |
| -3.070000000000148 | -3.07 | -6.14 | -9.21 |
| -3.060000000000148 | -3.06 | -6.12 | -9.18 |
| -3.050000000000148 | -3.05 | -6.1 | -9.15 |
| -3.040000000000148 | -3.04 | -6.08 | -9.12 |
| -3.030000000000149 | -3.03 | -6.06 | -9.09 |
| -3.020000000000149 | -3.02 | -6.04 | -9.06 |
| -3.010000000000149 | -3.01 | -6.02 | -9.03 |
| -3.000000000000149 | -3 | -6 | -9 |
| -2.990000000000149 | -2.99 | -5.98 | -8.97 |
| -2.98000000000015 | -2.98 | -5.96 | -8.94 |
| -2.97000000000015 | -2.97 | -5.94 | -8.91 |
| -2.96000000000015 | -2.96 | -5.92 | -8.88 |
| -2.95000000000015 | -2.95 | -5.9 | -8.85 |
| -2.94000000000015 | -2.94 | -5.88 | -8.82 |
| -2.930000000000151 | -2.93 | -5.86 | -8.79 |
| -2.920000000000151 | -2.92 | -5.84 | -8.76 |
| -2.910000000000151 | -2.91 | -5.82 | -8.73 |
| -2.900000000000151 | -2.9 | -5.8 | -8.7 |
| -2.890000000000151 | -2.89 | -5.78 | -8.67 |
| -2.880000000000152 | -2.88 | -5.76 | -8.64 |
| -2.870000000000152 | -2.87 | -5.74 | -8.61 |
| -2.860000000000152 | -2.86 | -5.72 | -8.58 |
| -2.850000000000152 | -2.85 | -5.7 | -8.55 |
| -2.840000000000153 | -2.84 | -5.68 | -8.52 |
| -2.830000000000153 | -2.83 | -5.66 | -8.49 |
| -2.820000000000153 | -2.82 | -5.64 | -8.46 |
| -2.810000000000153 | -2.81 | -5.62 | -8.43 |
| -2.800000000000153 | -2.8 | -5.6 | -8.4 |
| -2.790000000000154 | -2.79 | -5.58 | -8.37 |
| -2.780000000000154 | -2.78 | -5.56 | -8.34 |
| -2.770000000000154 | -2.77 | -5.54 | -8.31 |
| -2.760000000000154 | -2.76 | -5.52 | -8.28 |
| -2.750000000000154 | -2.75 | -5.5 | -8.25 |
| -2.740000000000155 | -2.74 | -5.48 | -8.22 |
| -2.730000000000155 | -2.73 | -5.46 | -8.19 |
| -2.720000000000155 | -2.72 | -5.44 | -8.16 |
| -2.710000000000155 | -2.71 | -5.42 | -8.13 |
| -2.700000000000156 | -2.7 | -5.4 | -8.1 |
| -2.690000000000156 | -2.69 | -5.38 | -8.07 |
| -2.680000000000156 | -2.68 | -5.36 | -8.04 |
| -2.670000000000156 | -2.67 | -5.34 | -8.01 |
| -2.660000000000156 | -2.66 | -5.32 | -7.98 |
| -2.650000000000157 | -2.65 | -5.3 | -7.95 |
| -2.640000000000157 | -2.64 | -5.28 | -7.92 |
| -2.630000000000157 | -2.63 | -5.26 | -7.89 |
| -2.620000000000157 | -2.62 | -5.24 | -7.86 |
| -2.610000000000157 | -2.61 | -5.22 | -7.83 |
| -2.600000000000158 | -2.6 | -5.2 | -7.8 |
| -2.590000000000158 | -2.59 | -5.18 | -7.77 |
| -2.580000000000158 | -2.58 | -5.16 | -7.74 |
| -2.570000000000158 | -2.57 | -5.14 | -7.71 |
| -2.560000000000159 | -2.56 | -5.12 | -7.68 |
| -2.550000000000159 | -2.55 | -5.1 | -7.65 |
| -2.54000000000016 | -2.54 | -5.08 | -7.62 |
| -2.530000000000159 | -2.53 | -5.06 | -7.59 |
| -2.520000000000159 | -2.52 | -5.04 | -7.56 |
| -2.51000000000016 | -2.51 | -5.02 | -7.53 |
| -2.50000000000016 | -2.5 | -5 | -7.5 |
| -2.49000000000016 | -2.49 | -4.98 | -7.47 |
| -2.48000000000016 | -2.48 | -4.96 | -7.44 |
| -2.47000000000016 | -2.47 | -4.94 | -7.41 |
| -2.460000000000161 | -2.46 | -4.92 | -7.38 |
| -2.450000000000161 | -2.45 | -4.9 | -7.35 |
| -2.440000000000161 | -2.44 | -4.88 | -7.32 |
| -2.430000000000161 | -2.43 | -4.86 | -7.29 |
| -2.420000000000162 | -2.42 | -4.84 | -7.26 |
| -2.410000000000162 | -2.41 | -4.82 | -7.23 |
| -2.400000000000162 | -2.4 | -4.8 | -7.2 |
| -2.390000000000162 | -2.39 | -4.78 | -7.17 |
| -2.380000000000162 | -2.38 | -4.76 | -7.14 |
| -2.370000000000163 | -2.37 | -4.74 | -7.11 |
| -2.360000000000163 | -2.36 | -4.72 | -7.08 |
| -2.350000000000163 | -2.35 | -4.7 | -7.05 |
| -2.340000000000163 | -2.34 | -4.68 | -7.02 |
| -2.330000000000163 | -2.33 | -4.66 | -6.99 |
| -2.320000000000164 | -2.32 | -4.64 | -6.96 |
| -2.310000000000164 | -2.31 | -4.62 | -6.93 |
| -2.300000000000164 | -2.3 | -4.6 | -6.9 |
| -2.290000000000164 | -2.29 | -4.58 | -6.87 |
| -2.280000000000165 | -2.28 | -4.56 | -6.84 |
| -2.270000000000165 | -2.27 | -4.54 | -6.81 |
| -2.260000000000165 | -2.26 | -4.52 | -6.78 |
| -2.250000000000165 | -2.25 | -4.5 | -6.75 |
| -2.240000000000165 | -2.24 | -4.48 | -6.72 |
| -2.230000000000166 | -2.23 | -4.46 | -6.69 |
| -2.220000000000166 | -2.22 | -4.44 | -6.66 |
| -2.210000000000166 | -2.21 | -4.42 | -6.63 |
| -2.200000000000166 | -2.2 | -4.4 | -6.6 |
| -2.190000000000166 | -2.19 | -4.38 | -6.57 |
| -2.180000000000167 | -2.18 | -4.36 | -6.54 |
| -2.170000000000167 | -2.17 | -4.34 | -6.51 |
| -2.160000000000167 | -2.16 | -4.32 | -6.48 |
| -2.150000000000167 | -2.15 | -4.3 | -6.45 |
| -2.140000000000168 | -2.14 | -4.28 | -6.42 |
| -2.130000000000168 | -2.13 | -4.26 | -6.39 |
| -2.120000000000168 | -2.12 | -4.24 | -6.36 |
| -2.110000000000168 | -2.11 | -4.22 | -6.33 |
| -2.100000000000168 | -2.1 | -4.2 | -6.3 |
| -2.090000000000169 | -2.09 | -4.18 | -6.27 |
| -2.080000000000169 | -2.08 | -4.16 | -6.24 |
| -2.070000000000169 | -2.07 | -4.14 | -6.21 |
| -2.060000000000169 | -2.06 | -4.12 | -6.18 |
| -2.050000000000169 | -2.05 | -4.1 | -6.15 |
| -2.04000000000017 | -2.04 | -4.08 | -6.12 |
| -2.03000000000017 | -2.03 | -4.06 | -6.09 |
| -2.02000000000017 | -2.02 | -4.04 | -6.06 |
| -2.01000000000017 | -2.01 | -4.02 | -6.03 |
| -2.000000000000171 | -2 | -4 | -6 |
| -1.99000000000017 | -1.99 | -3.98 | -5.97 |
| -1.98000000000017 | -1.98 | -3.96 | -5.94 |
| -1.97000000000017 | -1.97 | -3.94 | -5.91 |
| -1.96000000000017 | -1.96 | -3.92 | -5.88 |
| -1.95000000000017 | -1.95 | -3.9 | -5.85 |
| -1.94000000000017 | -1.94 | -3.88 | -5.82 |
| -1.93000000000017 | -1.93 | -3.86 | -5.79 |
| -1.92000000000017 | -1.92 | -3.84 | -5.76 |
| -1.91000000000017 | -1.91 | -3.82 | -5.73 |
| -1.90000000000017 | -1.9 | -3.8 | -5.7 |
| -1.89000000000017 | -1.89 | -3.78 | -5.67 |
| -1.88000000000017 | -1.88 | -3.76 | -5.64 |
| -1.87000000000017 | -1.87 | -3.74 | -5.61 |
| -1.86000000000017 | -1.86 | -3.72 | -5.58 |
| -1.85000000000017 | -1.85 | -3.7 | -5.55 |
| -1.84000000000017 | -1.84 | -3.68 | -5.52 |
| -1.83000000000017 | -1.83 | -3.66 | -5.49 |
| -1.82000000000017 | -1.82 | -3.64 | -5.46 |
| -1.81000000000017 | -1.81 | -3.62 | -5.43 |
| -1.80000000000017 | -1.8 | -3.6 | -5.4 |
| -1.79000000000017 | -1.79 | -3.58 | -5.37 |
| -1.78000000000017 | -1.78 | -3.56 | -5.34 |
| -1.77000000000017 | -1.77 | -3.54 | -5.31 |
| -1.76000000000017 | -1.76 | -3.52 | -5.28 |
| -1.75000000000017 | -1.75 | -3.5 | -5.25 |
| -1.74000000000017 | -1.74 | -3.48 | -5.22 |
| -1.73000000000017 | -1.73 | -3.46 | -5.19 |
| -1.72000000000017 | -1.72 | -3.44 | -5.16 |
| -1.71000000000017 | -1.71 | -3.42 | -5.13 |
| -1.70000000000017 | -1.7 | -3.4 | -5.1 |
| -1.69000000000017 | -1.69 | -3.38 | -5.07 |
| -1.68000000000017 | -1.68 | -3.36 | -5.04 |
| -1.67000000000017 | -1.67 | -3.34 | -5.01 |
| -1.66000000000017 | -1.66 | -3.32 | -4.98 |
| -1.65000000000017 | -1.65 | -3.3 | -4.95 |
| -1.64000000000017 | -1.64 | -3.28 | -4.92 |
| -1.63000000000017 | -1.63 | -3.26 | -4.89 |
| -1.62000000000017 | -1.62 | -3.24 | -4.86 |
| -1.61000000000017 | -1.61 | -3.22 | -4.83 |
| -1.60000000000017 | -1.6 | -3.2 | -4.8 |
| -1.59000000000017 | -1.59 | -3.18 | -4.77 |
| -1.58000000000017 | -1.58 | -3.16 | -4.74 |
| -1.57000000000017 | -1.57 | -3.14 | -4.71 |
| -1.56000000000017 | -1.56 | -3.12 | -4.68 |
| -1.55000000000017 | -1.55 | -3.1 | -4.65 |
| -1.54000000000017 | -1.54 | -3.08 | -4.62 |
| -1.53000000000017 | -1.53 | -3.06 | -4.59 |
| -1.52000000000017 | -1.52 | -3.04 | -4.56 |
| -1.51000000000017 | -1.51 | -3.02 | -4.53 |
| -1.50000000000017 | -1.5 | -3 | -4.5 |
| -1.49000000000017 | -1.49 | -2.98 | -4.47 |
| -1.48000000000017 | -1.48 | -2.96 | -4.44 |
| -1.47000000000017 | -1.47 | -2.94 | -4.41 |
| -1.46000000000017 | -1.46 | -2.92 | -4.38 |
| -1.45000000000017 | -1.45 | -2.9 | -4.35 |
| -1.44000000000017 | -1.44 | -2.88 | -4.32 |
| -1.43000000000017 | -1.43 | -2.86 | -4.29 |
| -1.42000000000017 | -1.42 | -2.84 | -4.26 |
| -1.41000000000017 | -1.41 | -2.82 | -4.23 |
| -1.40000000000017 | -1.4 | -2.8 | -4.2 |
| -1.39000000000017 | -1.39 | -2.78 | -4.17 |
| -1.38000000000017 | -1.38 | -2.76 | -4.14 |
| -1.37000000000017 | -1.37 | -2.74 | -4.11 |
| -1.36000000000017 | -1.36 | -2.72 | -4.08 |
| -1.35000000000017 | -1.35 | -2.7 | -4.05 |
| -1.34000000000017 | -1.34 | -2.68 | -4.02 |
| -1.33000000000017 | -1.33 | -2.66 | -3.99 |
| -1.32000000000017 | -1.32 | -2.64 | -3.96 |
| -1.31000000000017 | -1.31 | -2.62 | -3.93 |
| -1.30000000000017 | -1.3 | -2.6 | -3.9 |
| -1.29000000000017 | -1.29 | -2.58 | -3.87 |
| -1.28000000000017 | -1.28 | -2.56 | -3.84 |
| -1.27000000000017 | -1.27 | -2.54 | -3.81 |
| -1.26000000000017 | -1.26 | -2.52 | -3.78 |
| -1.25000000000017 | -1.25 | -2.5 | -3.75 |
| -1.24000000000017 | -1.24 | -2.48 | -3.72 |
| -1.23000000000017 | -1.23 | -2.46 | -3.69 |
| -1.22000000000017 | -1.22 | -2.44 | -3.66 |
| -1.21000000000017 | -1.21 | -2.42 | -3.63 |
| -1.20000000000017 | -1.2 | -2.4 | -3.6 |
| -1.19000000000017 | -1.19 | -2.38 | -3.57 |
| -1.18000000000017 | -1.18 | -2.36 | -3.54 |
| -1.17000000000017 | -1.17 | -2.34 | -3.51 |
| -1.16000000000017 | -1.16 | -2.32 | -3.48 |
| -1.15000000000017 | -1.15 | -2.3 | -3.45 |
| -1.14000000000017 | -1.14 | -2.28 | -3.42 |
| -1.13000000000017 | -1.13 | -2.26 | -3.39 |
| -1.12000000000017 | -1.12 | -2.24 | -3.36 |
| -1.11000000000017 | -1.11 | -2.22 | -3.33 |
| -1.10000000000017 | -1.1 | -2.2 | -3.3 |
| -1.09000000000017 | -1.09 | -2.18 | -3.27 |
| -1.08000000000017 | -1.08 | -2.16 | -3.24 |
| -1.07000000000017 | -1.07 | -2.14 | -3.21 |
| -1.06000000000017 | -1.06 | -2.12 | -3.18 |
| -1.05000000000017 | -1.05 | -2.1 | -3.15 |
| -1.04000000000017 | -1.04 | -2.08 | -3.12 |
| -1.03000000000017 | -1.03 | -2.06 | -3.09 |
| -1.02000000000017 | -1.02 | -2.04 | -3.06 |
| -1.01000000000017 | -1.01 | -2.02 | -3.03 |
| -1.00000000000017 | -1 | -2 | -3 |
| -0.99000000000017 | -0.99 | -1.98 | -2.97 |
| -0.98000000000017 | -0.98 | -1.96 | -2.94 |
| -0.97000000000017 | -0.97 | -1.94 | -2.91 |
| -0.96000000000017 | -0.96 | -1.92 | -2.88 |
| -0.95000000000017 | -0.95 | -1.9 | -2.85 |
| -0.94000000000017 | -0.94 | -1.88 | -2.82 |
| -0.93000000000017 | -0.93 | -1.86 | -2.79 |
| -0.92000000000017 | -0.92 | -1.84 | -2.76 |
| -0.91000000000017 | -0.91 | -1.82 | -2.73 |
| -0.90000000000017 | -0.9 | -1.8 | -2.7 |
| -0.890000000000169 | -0.89 | -1.78 | -2.67 |
| -0.880000000000169 | -0.88 | -1.76 | -2.64 |
| -0.870000000000169 | -0.87 | -1.74 | -2.61 |
| -0.860000000000169 | -0.86 | -1.72 | -2.58 |
| -0.850000000000169 | -0.85 | -1.7 | -2.55 |
| -0.840000000000169 | -0.84 | -1.68 | -2.52 |
| -0.830000000000169 | -0.83 | -1.66 | -2.49 |
| -0.820000000000169 | -0.82 | -1.64 | -2.46 |
| -0.810000000000169 | -0.81 | -1.62 | -2.43 |
| -0.800000000000169 | -0.8 | -1.6 | -2.4 |
| -0.790000000000169 | -0.79 | -1.58 | -2.37 |
| -0.780000000000169 | -0.78 | -1.56 | -2.34 |
| -0.770000000000169 | -0.77 | -1.54 | -2.31 |
| -0.760000000000169 | -0.76 | -1.52 | -2.28 |
| -0.750000000000169 | -0.75 | -1.5 | -2.25 |
| -0.740000000000169 | -0.74 | -1.48 | -2.22 |
| -0.730000000000169 | -0.73 | -1.46 | -2.19 |
| -0.720000000000169 | -0.72 | -1.44 | -2.16 |
| -0.710000000000169 | -0.71 | -1.42 | -2.13 |
| -0.700000000000169 | -0.7 | -1.4 | -2.1 |
| -0.690000000000169 | -0.69 | -1.38 | -2.07 |
| -0.680000000000169 | -0.68 | -1.36 | -2.04 |
| -0.670000000000169 | -0.67 | -1.34 | -2.01 |
| -0.660000000000169 | -0.66 | -1.32 | -1.98 |
| -0.650000000000169 | -0.65 | -1.3 | -1.95 |
| -0.640000000000169 | -0.64 | -1.28 | -1.92 |
| -0.630000000000169 | -0.63 | -1.26 | -1.89 |
| -0.620000000000169 | -0.62 | -1.24 | -1.86 |
| -0.610000000000169 | -0.61 | -1.22 | -1.83 |
| -0.600000000000169 | -0.6 | -1.2 | -1.8 |
| -0.590000000000169 | -0.59 | -1.18 | -1.77 |
| -0.580000000000169 | -0.58 | -1.16 | -1.74 |
| -0.570000000000169 | -0.57 | -1.14 | -1.71 |
| -0.560000000000169 | -0.56 | -1.12 | -1.68 |
| -0.550000000000169 | -0.55 | -1.1 | -1.65 |
| -0.540000000000169 | -0.54 | -1.08 | -1.62 |
| -0.530000000000169 | -0.53 | -1.06 | -1.59 |
| -0.520000000000169 | -0.52 | -1.04 | -1.56 |
| -0.510000000000169 | -0.51 | -1.02 | -1.53 |
| -0.500000000000169 | -0.5 | -1 | -1.5 |
| -0.490000000000169 | -0.49 | -0.98 | -1.47 |
| -0.480000000000169 | -0.48 | -0.96 | -1.44 |
| -0.470000000000169 | -0.47 | -0.94 | -1.41 |
| -0.460000000000169 | -0.46 | -0.92 | -1.38 |
| -0.450000000000169 | -0.45 | -0.9 | -1.35 |
| -0.440000000000169 | -0.44 | -0.88 | -1.32 |
| -0.430000000000169 | -0.43 | -0.86 | -1.29 |
| -0.420000000000169 | -0.42 | -0.84 | -1.26 |
| -0.410000000000169 | -0.41 | -0.82 | -1.23 |
| -0.400000000000169 | -0.4 | -0.8 | -1.2 |
| -0.390000000000169 | -0.39 | -0.78 | -1.17 |
| -0.380000000000169 | -0.38 | -0.76 | -1.14 |
| -0.370000000000169 | -0.37 | -0.74 | -1.11 |
| -0.360000000000169 | -0.36 | -0.72 | -1.08 |
| -0.350000000000169 | -0.35 | -0.7 | -1.05 |
| -0.340000000000169 | -0.34 | -0.68 | -1.02 |
| -0.330000000000169 | -0.33 | -0.66 | -0.99 |
| -0.320000000000169 | -0.32 | -0.64 | -0.96 |
| -0.310000000000169 | -0.31 | -0.62 | -0.93 |
| -0.300000000000169 | -0.3 | -0.6 | -0.9 |
| -0.290000000000169 | -0.29 | -0.58 | -0.87 |
| -0.280000000000169 | -0.28 | -0.56 | -0.84 |
| -0.270000000000169 | -0.27 | -0.54 | -0.81 |
| -0.260000000000169 | -0.26 | -0.52 | -0.78 |
| -0.250000000000169 | -0.25 | -0.5 | -0.75 |
| -0.240000000000169 | -0.24 | -0.48 | -0.72 |
| -0.230000000000169 | -0.23 | -0.46 | -0.69 |
| -0.220000000000169 | -0.22 | -0.44 | -0.66 |
| -0.210000000000169 | -0.21 | -0.42 | -0.63 |
| -0.200000000000169 | -0.2 | -0.4 | -0.6 |
| -0.190000000000169 | -0.19 | -0.38 | -0.57 |
| -0.180000000000169 | -0.18 | -0.36 | -0.54 |
| -0.170000000000169 | -0.17 | -0.34 | -0.51 |
| -0.160000000000169 | -0.16 | -0.32 | -0.48 |
| -0.150000000000169 | -0.15 | -0.3 | -0.45 |
| -0.140000000000169 | -0.14 | -0.28 | -0.42 |
| -0.130000000000169 | -0.13 | -0.26 | -0.39 |
| -0.120000000000169 | -0.12 | -0.24 | -0.36 |
| -0.110000000000169 | -0.11 | -0.22 | -0.33 |
| -0.100000000000169 | -0.1 | -0.2 | -0.3 |
| -0.0900000000001689 | -0.09 | -0.18 | -0.27 |
| -0.0800000000001689 | -0.08 | -0.16 | -0.24 |
| -0.0700000000001689 | -0.07 | -0.14 | -0.21 |
| -0.0600000000001689 | -0.06 | -0.12 | -0.18 |
| -0.0500000000001689 | -0.05 | -0.1 | -0.15 |
| -0.0400000000001689 | -0.04 | -0.08 | -0.12 |
| -0.0300000000001689 | -0.03 | -0.06 | -0.09 |
| -0.0200000000001689 | -0.02 | -0.04 | -0.06 |
| -0.0100000000001689 | -0.01 | -0.02 | -0.03 |
| -1.6888920817415e-13 | 0 | 0 | 0 |
| 0.00999999999983111 | 0.01 | 0.02 | 0.03 |
| 0.0199999999998311 | 0.02 | 0.04 | 0.06 |
| 0.0299999999998311 | 0.03 | 0.06 | 0.09 |
| 0.0399999999998311 | 0.04 | 0.08 | 0.12 |
| 0.0499999999998311 | 0.05 | 0.1 | 0.15 |
| 0.0599999999998311 | 0.06 | 0.12 | 0.18 |
| 0.0699999999998311 | 0.07 | 0.14 | 0.21 |
| 0.0799999999998311 | 0.08 | 0.16 | 0.24 |
| 0.0899999999998311 | 0.09 | 0.18 | 0.27 |
| 0.0999999999998311 | 0.1 | 0.2 | 0.3 |
| 0.109999999999831 | 0.11 | 0.22 | 0.33 |
| 0.119999999999831 | 0.12 | 0.24 | 0.36 |
| 0.129999999999831 | 0.13 | 0.26 | 0.39 |
| 0.139999999999831 | 0.14 | 0.28 | 0.42 |
| 0.149999999999831 | 0.15 | 0.3 | 0.45 |
| 0.159999999999831 | 0.16 | 0.32 | 0.48 |
| 0.169999999999831 | 0.17 | 0.34 | 0.51 |
| 0.179999999999831 | 0.18 | 0.36 | 0.54 |
| 0.189999999999831 | 0.19 | 0.38 | 0.57 |
| 0.199999999999831 | 0.2 | 0.4 | 0.6 |
| 0.209999999999831 | 0.21 | 0.42 | 0.63 |
| 0.219999999999831 | 0.22 | 0.44 | 0.66 |
| 0.229999999999831 | 0.23 | 0.46 | 0.69 |
| 0.239999999999831 | 0.24 | 0.48 | 0.72 |
| 0.249999999999831 | 0.25 | 0.5 | 0.75 |
| 0.259999999999831 | 0.26 | 0.52 | 0.78 |
| 0.269999999999831 | 0.27 | 0.54 | 0.81 |
| 0.279999999999831 | 0.28 | 0.56 | 0.84 |
| 0.289999999999831 | 0.29 | 0.58 | 0.87 |
| 0.299999999999831 | 0.3 | 0.6 | 0.9 |
| 0.309999999999831 | 0.31 | 0.62 | 0.93 |
| 0.319999999999831 | 0.32 | 0.64 | 0.96 |
| 0.329999999999831 | 0.33 | 0.66 | 0.99 |
| 0.339999999999831 | 0.34 | 0.68 | 1.02 |
| 0.349999999999831 | 0.35 | 0.7 | 1.05 |
| 0.359999999999831 | 0.36 | 0.72 | 1.08 |
| 0.369999999999831 | 0.37 | 0.74 | 1.11 |
| 0.379999999999831 | 0.38 | 0.76 | 1.14 |
| 0.389999999999831 | 0.39 | 0.78 | 1.17 |
| 0.399999999999831 | 0.4 | 0.8 | 1.2 |
| 0.409999999999831 | 0.41 | 0.82 | 1.23 |
| 0.419999999999831 | 0.42 | 0.84 | 1.26 |
| 0.429999999999831 | 0.43 | 0.86 | 1.29 |
| 0.439999999999831 | 0.44 | 0.88 | 1.32 |
| 0.449999999999831 | 0.45 | 0.9 | 1.35 |
| 0.459999999999831 | 0.46 | 0.92 | 1.38 |
| 0.469999999999831 | 0.47 | 0.94 | 1.41 |
| 0.479999999999831 | 0.48 | 0.96 | 1.44 |
| 0.489999999999831 | 0.49 | 0.98 | 1.47 |
| 0.499999999999831 | 0.5 | 1 | 1.5 |
| 0.509999999999831 | 0.51 | 1.02 | 1.53 |
| 0.519999999999831 | 0.52 | 1.04 | 1.56 |
| 0.529999999999831 | 0.53 | 1.06 | 1.59 |
| 0.539999999999831 | 0.54 | 1.08 | 1.62 |
| 0.549999999999831 | 0.55 | 1.1 | 1.65 |
| 0.559999999999831 | 0.56 | 1.12 | 1.68 |
| 0.569999999999831 | 0.57 | 1.14 | 1.71 |
| 0.579999999999831 | 0.58 | 1.16 | 1.74 |
| 0.589999999999831 | 0.59 | 1.18 | 1.77 |
| 0.599999999999831 | 0.6 | 1.2 | 1.8 |
| 0.609999999999831 | 0.61 | 1.22 | 1.83 |
| 0.619999999999831 | 0.62 | 1.24 | 1.86 |
| 0.629999999999831 | 0.63 | 1.26 | 1.89 |
| 0.639999999999831 | 0.64 | 1.28 | 1.92 |
| 0.649999999999831 | 0.65 | 1.3 | 1.95 |
| 0.659999999999831 | 0.66 | 1.32 | 1.98 |
| 0.669999999999831 | 0.67 | 1.34 | 2.01 |
| 0.679999999999831 | 0.68 | 1.36 | 2.04 |
| 0.689999999999831 | 0.69 | 1.38 | 2.07 |
| 0.699999999999831 | 0.7 | 1.4 | 2.1 |
| 0.709999999999831 | 0.71 | 1.42 | 2.13 |
| 0.719999999999831 | 0.72 | 1.44 | 2.16 |
| 0.729999999999831 | 0.73 | 1.46 | 2.19 |
| 0.739999999999831 | 0.74 | 1.48 | 2.22 |
| 0.749999999999832 | 0.75 | 1.5 | 2.25 |
| 0.759999999999832 | 0.76 | 1.52 | 2.28 |
| 0.769999999999832 | 0.77 | 1.54 | 2.31 |
| 0.779999999999832 | 0.78 | 1.56 | 2.34 |
| 0.789999999999832 | 0.79 | 1.58 | 2.37 |
| 0.799999999999832 | 0.8 | 1.6 | 2.4 |
| 0.809999999999832 | 0.81 | 1.62 | 2.43 |
| 0.819999999999832 | 0.82 | 1.64 | 2.46 |
| 0.829999999999832 | 0.83 | 1.66 | 2.49 |
| 0.839999999999832 | 0.84 | 1.68 | 2.52 |
| 0.849999999999832 | 0.85 | 1.7 | 2.55 |
| 0.859999999999832 | 0.86 | 1.72 | 2.58 |
| 0.869999999999832 | 0.87 | 1.74 | 2.61 |
| 0.879999999999832 | 0.88 | 1.76 | 2.64 |
| 0.889999999999832 | 0.89 | 1.78 | 2.67 |
| 0.899999999999832 | 0.9 | 1.8 | 2.7 |
| 0.909999999999832 | 0.91 | 1.82 | 2.73 |
| 0.919999999999832 | 0.92 | 1.84 | 2.76 |
| 0.929999999999832 | 0.93 | 1.86 | 2.79 |
| 0.939999999999832 | 0.94 | 1.88 | 2.82 |
| 0.949999999999832 | 0.95 | 1.9 | 2.85 |
| 0.959999999999832 | 0.96 | 1.92 | 2.88 |
| 0.969999999999832 | 0.97 | 1.94 | 2.91 |
| 0.979999999999832 | 0.98 | 1.96 | 2.94 |
| 0.989999999999832 | 0.99 | 1.98 | 2.97 |
| 0.999999999999832 | 1 | 2 | 3 |
| 1.009999999999832 | 1.01 | 2.02 | 3.03 |
| 1.019999999999832 | 1.02 | 2.04 | 3.06 |
| 1.029999999999832 | 1.03 | 2.06 | 3.09 |
| 1.039999999999832 | 1.04 | 2.08 | 3.12 |
| 1.049999999999832 | 1.05 | 2.1 | 3.15 |
| 1.059999999999832 | 1.06 | 2.12 | 3.18 |
| 1.069999999999832 | 1.07 | 2.14 | 3.21 |
| 1.079999999999832 | 1.08 | 2.16 | 3.24 |
| 1.089999999999832 | 1.09 | 2.18 | 3.27 |
| 1.099999999999832 | 1.1 | 2.2 | 3.3 |
| 1.109999999999832 | 1.11 | 2.22 | 3.33 |
| 1.119999999999832 | 1.12 | 2.24 | 3.36 |
| 1.129999999999832 | 1.13 | 2.26 | 3.39 |
| 1.139999999999832 | 1.14 | 2.28 | 3.42 |
| 1.149999999999832 | 1.15 | 2.3 | 3.45 |
| 1.159999999999832 | 1.16 | 2.32 | 3.48 |
| 1.169999999999832 | 1.17 | 2.34 | 3.51 |
| 1.179999999999832 | 1.18 | 2.36 | 3.54 |
| 1.189999999999832 | 1.19 | 2.38 | 3.57 |
| 1.199999999999832 | 1.2 | 2.4 | 3.6 |
| 1.209999999999832 | 1.21 | 2.42 | 3.63 |
| 1.219999999999832 | 1.22 | 2.44 | 3.66 |
| 1.229999999999832 | 1.23 | 2.46 | 3.69 |
| 1.239999999999832 | 1.24 | 2.48 | 3.72 |
| 1.249999999999832 | 1.25 | 2.5 | 3.75 |
| 1.259999999999832 | 1.26 | 2.52 | 3.78 |
| 1.269999999999832 | 1.27 | 2.54 | 3.81 |
| 1.279999999999832 | 1.28 | 2.56 | 3.84 |
| 1.289999999999832 | 1.29 | 2.58 | 3.87 |
| 1.299999999999832 | 1.3 | 2.6 | 3.9 |
| 1.309999999999832 | 1.31 | 2.62 | 3.93 |
| 1.319999999999832 | 1.32 | 2.64 | 3.96 |
| 1.329999999999832 | 1.33 | 2.66 | 3.99 |
| 1.339999999999832 | 1.34 | 2.68 | 4.02 |
| 1.349999999999832 | 1.35 | 2.7 | 4.05 |
| 1.359999999999832 | 1.36 | 2.72 | 4.08 |
| 1.369999999999832 | 1.37 | 2.74 | 4.11 |
| 1.379999999999832 | 1.38 | 2.76 | 4.14 |
| 1.389999999999832 | 1.39 | 2.78 | 4.17 |
| 1.399999999999832 | 1.4 | 2.8 | 4.2 |
| 1.409999999999832 | 1.41 | 2.82 | 4.23 |
| 1.419999999999832 | 1.42 | 2.84 | 4.26 |
| 1.429999999999832 | 1.43 | 2.86 | 4.29 |
| 1.439999999999832 | 1.44 | 2.88 | 4.32 |
| 1.449999999999832 | 1.45 | 2.9 | 4.35 |
| 1.459999999999832 | 1.46 | 2.92 | 4.38 |
| 1.469999999999832 | 1.47 | 2.94 | 4.41 |
| 1.479999999999832 | 1.48 | 2.96 | 4.44 |
| 1.489999999999832 | 1.49 | 2.98 | 4.47 |
| 1.499999999999832 | 1.5 | 3 | 4.5 |
| 1.509999999999832 | 1.51 | 3.02 | 4.53 |
| 1.519999999999832 | 1.52 | 3.04 | 4.56 |
| 1.529999999999832 | 1.53 | 3.06 | 4.59 |
| 1.539999999999832 | 1.54 | 3.08 | 4.62 |
| 1.549999999999832 | 1.55 | 3.1 | 4.65 |
| 1.559999999999832 | 1.56 | 3.12 | 4.68 |
| 1.569999999999832 | 1.57 | 3.14 | 4.71 |
| 1.579999999999832 | 1.58 | 3.16 | 4.74 |
| 1.589999999999832 | 1.59 | 3.18 | 4.77 |
| 1.599999999999832 | 1.6 | 3.2 | 4.8 |
| 1.609999999999832 | 1.61 | 3.22 | 4.83 |
| 1.619999999999832 | 1.62 | 3.24 | 4.86 |
| 1.629999999999832 | 1.63 | 3.26 | 4.89 |
| 1.639999999999832 | 1.64 | 3.28 | 4.92 |
| 1.649999999999832 | 1.65 | 3.3 | 4.95 |
| 1.659999999999832 | 1.66 | 3.32 | 4.98 |
| 1.669999999999832 | 1.67 | 3.34 | 5.01 |
| 1.679999999999832 | 1.68 | 3.36 | 5.04 |
| 1.689999999999832 | 1.69 | 3.38 | 5.07 |
| 1.699999999999832 | 1.7 | 3.4 | 5.1 |
| 1.709999999999832 | 1.71 | 3.42 | 5.13 |
| 1.719999999999832 | 1.72 | 3.44 | 5.16 |
| 1.729999999999832 | 1.73 | 3.46 | 5.19 |
| 1.739999999999832 | 1.74 | 3.48 | 5.22 |
| 1.749999999999832 | 1.75 | 3.5 | 5.25 |
| 1.759999999999832 | 1.76 | 3.52 | 5.28 |
| 1.769999999999832 | 1.77 | 3.54 | 5.31 |
| 1.779999999999832 | 1.78 | 3.56 | 5.34 |
| 1.789999999999832 | 1.79 | 3.58 | 5.37 |
| 1.799999999999832 | 1.8 | 3.6 | 5.4 |
| 1.809999999999832 | 1.81 | 3.62 | 5.43 |
| 1.819999999999832 | 1.82 | 3.64 | 5.46 |
| 1.829999999999832 | 1.83 | 3.66 | 5.49 |
| 1.839999999999832 | 1.84 | 3.68 | 5.52 |
| 1.849999999999832 | 1.85 | 3.7 | 5.55 |
| 1.859999999999832 | 1.86 | 3.72 | 5.58 |
| 1.869999999999832 | 1.87 | 3.74 | 5.61 |
| 1.879999999999832 | 1.88 | 3.76 | 5.64 |
| 1.889999999999832 | 1.89 | 3.78 | 5.67 |
| 1.899999999999832 | 1.9 | 3.8 | 5.7 |
| 1.909999999999832 | 1.91 | 3.82 | 5.73 |
| 1.919999999999832 | 1.92 | 3.84 | 5.76 |
| 1.929999999999832 | 1.93 | 3.86 | 5.79 |
| 1.939999999999832 | 1.94 | 3.88 | 5.82 |
| 1.949999999999833 | 1.95 | 3.9 | 5.85 |
| 1.959999999999833 | 1.96 | 3.92 | 5.88 |
| 1.969999999999833 | 1.97 | 3.94 | 5.91 |
| 1.979999999999833 | 1.98 | 3.96 | 5.94 |
| 1.989999999999833 | 1.99 | 3.98 | 5.97 |
| 1.999999999999833 | 2 | 4 | 6 |
| 2.009999999999832 | 2.01 | 4.02 | 6.03 |
| 2.019999999999832 | 2.02 | 4.04 | 6.06 |
| 2.029999999999832 | 2.03 | 4.06 | 6.09 |
| 2.039999999999832 | 2.04 | 4.08 | 6.12 |
| 2.049999999999832 | 2.05 | 4.1 | 6.15 |
| 2.059999999999831 | 2.06 | 4.12 | 6.18 |
| 2.069999999999831 | 2.07 | 4.14 | 6.21 |
| 2.079999999999831 | 2.08 | 4.16 | 6.24 |
| 2.089999999999831 | 2.09 | 4.18 | 6.27 |
| 2.09999999999983 | 2.1 | 4.2 | 6.3 |
| 2.10999999999983 | 2.11 | 4.22 | 6.33 |
| 2.11999999999983 | 2.12 | 4.24 | 6.36 |
| 2.12999999999983 | 2.13 | 4.26 | 6.39 |
| 2.13999999999983 | 2.14 | 4.28 | 6.42 |
| 2.149999999999829 | 2.15 | 4.3 | 6.45 |
| 2.159999999999829 | 2.16 | 4.32 | 6.48 |
| 2.169999999999829 | 2.17 | 4.34 | 6.51 |
| 2.179999999999829 | 2.18 | 4.36 | 6.54 |
| 2.189999999999829 | 2.19 | 4.38 | 6.57 |
| 2.199999999999828 | 2.2 | 4.4 | 6.6 |
| 2.209999999999828 | 2.21 | 4.42 | 6.63 |
| 2.219999999999828 | 2.22 | 4.44 | 6.66 |
| 2.229999999999828 | 2.23 | 4.46 | 6.69 |
| 2.239999999999827 | 2.24 | 4.48 | 6.72 |
| 2.249999999999827 | 2.25 | 4.5 | 6.75 |
| 2.259999999999827 | 2.26 | 4.52 | 6.78 |
| 2.269999999999827 | 2.27 | 4.54 | 6.81 |
| 2.279999999999827 | 2.28 | 4.56 | 6.84 |
| 2.289999999999826 | 2.29 | 4.58 | 6.87 |
| 2.299999999999826 | 2.3 | 4.6 | 6.9 |
| 2.309999999999826 | 2.31 | 4.62 | 6.93 |
| 2.319999999999826 | 2.32 | 4.64 | 6.96 |
| 2.329999999999825 | 2.33 | 4.66 | 6.99 |
| 2.339999999999825 | 2.34 | 4.68 | 7.02 |
| 2.349999999999825 | 2.35 | 4.7 | 7.05 |
| 2.359999999999825 | 2.36 | 4.72 | 7.08 |
| 2.369999999999825 | 2.37 | 4.74 | 7.11 |
| 2.379999999999824 | 2.38 | 4.76 | 7.14 |
| 2.389999999999824 | 2.39 | 4.78 | 7.17 |
| 2.399999999999824 | 2.4 | 4.8 | 7.2 |
| 2.409999999999824 | 2.41 | 4.82 | 7.23 |
| 2.419999999999824 | 2.42 | 4.84 | 7.26 |
| 2.429999999999823 | 2.43 | 4.86 | 7.29 |
| 2.439999999999823 | 2.44 | 4.88 | 7.32 |
| 2.449999999999823 | 2.45 | 4.9 | 7.35 |
| 2.459999999999823 | 2.46 | 4.92 | 7.38 |
| 2.469999999999823 | 2.47 | 4.94 | 7.41 |
| 2.479999999999822 | 2.48 | 4.96 | 7.44 |
| 2.489999999999822 | 2.49 | 4.98 | 7.47 |
| 2.499999999999822 | 2.5 | 5 | 7.5 |
| 2.509999999999822 | 2.51 | 5.02 | 7.53 |
| 2.519999999999821 | 2.52 | 5.04 | 7.56 |
| 2.529999999999821 | 2.53 | 5.06 | 7.59 |
| 2.539999999999821 | 2.54 | 5.08 | 7.62 |
| 2.549999999999821 | 2.55 | 5.1 | 7.65 |
| 2.559999999999821 | 2.56 | 5.12 | 7.68 |
| 2.56999999999982 | 2.57 | 5.14 | 7.71 |
| 2.57999999999982 | 2.58 | 5.16 | 7.74 |
| 2.58999999999982 | 2.59 | 5.18 | 7.77 |
| 2.59999999999982 | 2.6 | 5.2 | 7.8 |
| 2.609999999999819 | 2.61 | 5.22 | 7.83 |
| 2.619999999999819 | 2.62 | 5.24 | 7.86 |
| 2.629999999999819 | 2.63 | 5.26 | 7.89 |
| 2.639999999999819 | 2.64 | 5.28 | 7.92 |
| 2.649999999999819 | 2.65 | 5.3 | 7.95 |
| 2.659999999999818 | 2.66 | 5.32 | 7.98 |
| 2.669999999999818 | 2.67 | 5.34 | 8.01 |
| 2.679999999999818 | 2.68 | 5.36 | 8.04 |
| 2.689999999999818 | 2.69 | 5.38 | 8.07 |
| 2.699999999999818 | 2.7 | 5.4 | 8.1 |
| 2.709999999999817 | 2.71 | 5.42 | 8.13 |
| 2.719999999999817 | 2.72 | 5.44 | 8.16 |
| 2.729999999999817 | 2.73 | 5.46 | 8.19 |
| 2.739999999999817 | 2.74 | 5.48 | 8.22 |
| 2.749999999999817 | 2.75 | 5.5 | 8.25 |
| 2.759999999999816 | 2.76 | 5.52 | 8.28 |
| 2.769999999999816 | 2.77 | 5.54 | 8.31 |
| 2.779999999999816 | 2.78 | 5.56 | 8.34 |
| 2.789999999999816 | 2.79 | 5.58 | 8.37 |
| 2.799999999999815 | 2.8 | 5.6 | 8.4 |
| 2.809999999999815 | 2.81 | 5.62 | 8.43 |
| 2.819999999999815 | 2.82 | 5.64 | 8.46 |
| 2.829999999999815 | 2.83 | 5.66 | 8.49 |
| 2.839999999999815 | 2.84 | 5.68 | 8.52 |
| 2.849999999999814 | 2.85 | 5.7 | 8.55 |
| 2.859999999999814 | 2.86 | 5.72 | 8.58 |
| 2.869999999999814 | 2.87 | 5.74 | 8.61 |
| 2.879999999999814 | 2.88 | 5.76 | 8.64 |
| 2.889999999999814 | 2.89 | 5.78 | 8.67 |
| 2.899999999999813 | 2.9 | 5.8 | 8.7 |
| 2.909999999999813 | 2.91 | 5.82 | 8.73 |
| 2.919999999999813 | 2.92 | 5.84 | 8.76 |
| 2.929999999999813 | 2.93 | 5.86 | 8.79 |
| 2.939999999999813 | 2.94 | 5.88 | 8.82 |
| 2.949999999999812 | 2.95 | 5.9 | 8.85 |
| 2.959999999999812 | 2.96 | 5.92 | 8.88 |
| 2.969999999999812 | 2.97 | 5.94 | 8.91 |
| 2.979999999999812 | 2.98 | 5.96 | 8.94 |
| 2.989999999999811 | 2.99 | 5.98 | 8.97 |
| 2.999999999999811 | 3 | 6 | 9 |
| 3.009999999999811 | 3.01 | 6.02 | 9.03 |
| 3.019999999999811 | 3.02 | 6.04 | 9.06 |
| 3.029999999999811 | 3.03 | 6.06 | 9.09 |
| 3.03999999999981 | 3.04 | 6.08 | 9.12 |
| 3.04999999999981 | 3.05 | 6.1 | 9.15 |
| 3.05999999999981 | 3.06 | 6.12 | 9.18 |
| 3.06999999999981 | 3.07 | 6.14 | 9.21 |
| 3.07999999999981 | 3.08 | 6.16 | 9.24 |
| 3.089999999999809 | 3.09 | 6.18 | 9.27 |
| 3.099999999999809 | 3.1 | 6.2 | 9.3 |
| 3.109999999999809 | 3.11 | 6.22 | 9.33 |
| 3.119999999999809 | 3.12 | 6.24 | 9.36 |
| 3.129999999999808 | 3.13 | 6.26 | 9.39 |
| 3.139999999999808 | 3.14 | 6.28 | 9.42 |
| 3.149999999999808 | 3.15 | 6.3 | 9.45 |
| 3.159999999999808 | 3.16 | 6.32 | 9.48 |
| 3.169999999999808 | 3.17 | 6.34 | 9.51 |
| 3.179999999999807 | 3.18 | 6.36 | 9.54 |
| 3.189999999999807 | 3.19 | 6.38 | 9.57 |
| 3.199999999999807 | 3.2 | 6.4 | 9.6 |
| 3.209999999999807 | 3.21 | 6.42 | 9.63 |
| 3.219999999999807 | 3.22 | 6.44 | 9.66 |
| 3.229999999999806 | 3.23 | 6.46 | 9.69 |
| 3.239999999999806 | 3.24 | 6.48 | 9.72 |
| 3.249999999999806 | 3.25 | 6.5 | 9.75 |
| 3.259999999999806 | 3.26 | 6.52 | 9.78 |
| 3.269999999999805 | 3.27 | 6.54 | 9.81 |
| 3.279999999999805 | 3.28 | 6.56 | 9.84 |
| 3.289999999999805 | 3.29 | 6.58 | 9.87 |
| 3.299999999999805 | 3.3 | 6.6 | 9.9 |
| 3.309999999999805 | 3.31 | 6.62 | 9.93 |
| 3.319999999999804 | 3.32 | 6.64 | 9.96 |
| 3.329999999999804 | 3.33 | 6.66 | 9.99 |
| 3.339999999999804 | 3.34 | 6.68 | 10.02 |
| 3.349999999999804 | 3.35 | 6.7 | 10.05 |
| 3.359999999999804 | 3.36 | 6.72 | 10.08 |
| 3.369999999999803 | 3.37 | 6.74 | 10.11 |
| 3.379999999999803 | 3.38 | 6.76 | 10.14 |
| 3.389999999999803 | 3.39 | 6.78 | 10.17 |
| 3.399999999999803 | 3.4 | 6.8 | 10.2 |
| 3.409999999999802 | 3.41 | 6.82 | 10.23 |
| 3.419999999999802 | 3.42 | 6.84 | 10.26 |
| 3.429999999999802 | 3.43 | 6.86 | 10.29 |
| 3.439999999999802 | 3.44 | 6.88 | 10.32 |
| 3.449999999999802 | 3.45 | 6.9 | 10.35 |
| 3.459999999999801 | 3.46 | 6.92 | 10.38 |
| 3.469999999999801 | 3.47 | 6.94 | 10.41 |
| 3.479999999999801 | 3.48 | 6.96 | 10.44 |
| 3.489999999999801 | 3.49 | 6.98 | 10.47 |
| 3.499999999999801 | 3.5 | 7 | 10.5 |
| 3.5099999999998 | 3.51 | 7.02 | 10.53 |
| 3.5199999999998 | 3.52 | 7.04 | 10.56 |
| 3.5299999999998 | 3.53 | 7.06 | 10.59 |
| 3.5399999999998 | 3.54 | 7.08 | 10.62 |
| 3.5499999999998 | 3.55 | 7.1 | 10.65 |
| 3.559999999999799 | 3.56 | 7.12 | 10.68 |
| 3.569999999999799 | 3.57 | 7.14 | 10.71 |
| 3.579999999999799 | 3.58 | 7.16 | 10.74 |
| 3.589999999999799 | 3.59 | 7.18 | 10.77 |
| 3.599999999999798 | 3.6 | 7.2 | 10.8 |
| 3.609999999999798 | 3.61 | 7.22 | 10.83 |
| 3.619999999999798 | 3.62 | 7.24 | 10.86 |
| 3.629999999999798 | 3.63 | 7.26 | 10.89 |
| 3.639999999999798 | 3.64 | 7.28 | 10.92 |
| 3.649999999999797 | 3.65 | 7.3 | 10.95 |
| 3.659999999999797 | 3.66 | 7.32 | 10.98 |
| 3.669999999999797 | 3.67 | 7.34 | 11.01 |
| 3.679999999999797 | 3.68 | 7.36 | 11.04 |
| 3.689999999999796 | 3.69 | 7.38 | 11.07 |
| 3.699999999999796 | 3.7 | 7.4 | 11.1 |
| 3.709999999999796 | 3.71 | 7.42 | 11.13 |
| 3.719999999999796 | 3.72 | 7.44 | 11.16 |
| 3.729999999999796 | 3.73 | 7.46 | 11.19 |
| 3.739999999999795 | 3.74 | 7.48 | 11.22 |
| 3.749999999999795 | 3.75 | 7.5 | 11.25 |
| 3.759999999999795 | 3.76 | 7.52 | 11.28 |
| 3.769999999999795 | 3.77 | 7.54 | 11.31 |
| 3.779999999999795 | 3.78 | 7.56 | 11.34 |
| 3.789999999999794 | 3.79 | 7.58 | 11.37 |
| 3.799999999999794 | 3.8 | 7.6 | 11.4 |
| 3.809999999999794 | 3.81 | 7.62 | 11.43 |
| 3.819999999999794 | 3.82 | 7.64 | 11.46 |
| 3.829999999999794 | 3.83 | 7.66 | 11.49 |
| 3.839999999999793 | 3.84 | 7.68 | 11.52 |
| 3.849999999999793 | 3.85 | 7.7 | 11.55 |
| 3.859999999999793 | 3.86 | 7.72 | 11.58 |
| 3.869999999999793 | 3.87 | 7.74 | 11.61 |
| 3.879999999999792 | 3.88 | 7.76 | 11.64 |
| 3.889999999999792 | 3.89 | 7.78 | 11.67 |
| 3.899999999999792 | 3.9 | 7.8 | 11.7 |
| 3.909999999999792 | 3.91 | 7.82 | 11.73 |
| 3.919999999999792 | 3.92 | 7.84 | 11.76 |
| 3.929999999999791 | 3.93 | 7.86 | 11.79 |
| 3.939999999999791 | 3.94 | 7.88 | 11.82 |
| 3.949999999999791 | 3.95 | 7.9 | 11.85 |
| 3.959999999999791 | 3.96 | 7.92 | 11.88 |
| 3.969999999999791 | 3.97 | 7.94 | 11.91 |
| 3.97999999999979 | 3.98 | 7.96 | 11.94 |
| 3.98999999999979 | 3.99 | 7.98 | 11.97 |
| 3.99999999999979 | 4 | 8 | 12 |
| 4.00999999999979 | 4.01 | 8.02 | 12.03 |
| 4.01999999999979 | 4.02 | 8.04 | 12.06 |
| 4.02999999999979 | 4.03 | 8.06 | 12.09 |
| 4.03999999999979 | 4.04 | 8.08 | 12.12 |
| 4.04999999999979 | 4.05 | 8.1 | 12.15 |
| 4.05999999999979 | 4.06 | 8.12 | 12.18 |
| 4.069999999999789 | 4.07 | 8.14 | 12.21 |
| 4.079999999999788 | 4.08 | 8.16 | 12.24 |
| 4.089999999999788 | 4.09 | 8.18 | 12.27 |
| 4.099999999999788 | 4.1 | 8.2 | 12.3 |
| 4.109999999999788 | 4.11 | 8.22 | 12.33 |
| 4.119999999999788 | 4.12 | 8.24 | 12.36 |
| 4.129999999999788 | 4.13 | 8.26 | 12.39 |
| 4.139999999999787 | 4.14 | 8.28 | 12.42 |
| 4.149999999999787 | 4.15 | 8.3 | 12.45 |
| 4.159999999999787 | 4.16 | 8.32 | 12.48 |
| 4.169999999999787 | 4.17 | 8.34 | 12.51 |
| 4.179999999999786 | 4.18 | 8.36 | 12.54 |
| 4.189999999999786 | 4.19 | 8.38 | 12.57 |
| 4.199999999999786 | 4.2 | 8.4 | 12.6 |
| 4.209999999999785 | 4.21 | 8.42 | 12.63 |
| 4.219999999999785 | 4.22 | 8.44 | 12.66 |
| 4.229999999999785 | 4.23 | 8.46 | 12.69 |
| 4.239999999999785 | 4.24 | 8.48 | 12.72 |
| 4.249999999999785 | 4.25 | 8.5 | 12.75 |
| 4.259999999999784 | 4.26 | 8.52 | 12.78 |
| 4.269999999999784 | 4.27 | 8.54 | 12.81 |
| 4.279999999999784 | 4.28 | 8.56 | 12.84 |
| 4.289999999999784 | 4.29 | 8.58 | 12.87 |
| 4.299999999999784 | 4.3 | 8.6 | 12.9 |
| 4.309999999999784 | 4.31 | 8.62 | 12.93 |
| 4.319999999999784 | 4.32 | 8.64 | 12.96 |
| 4.329999999999783 | 4.33 | 8.66 | 12.99 |
| 4.339999999999783 | 4.34 | 8.68 | 13.02 |
| 4.349999999999783 | 4.35 | 8.7 | 13.05 |
| 4.359999999999783 | 4.36 | 8.72 | 13.08 |
| 4.369999999999782 | 4.37 | 8.74 | 13.11 |
| 4.379999999999782 | 4.38 | 8.76 | 13.14 |
| 4.389999999999782 | 4.39 | 8.78 | 13.17 |
| 4.399999999999782 | 4.4 | 8.8 | 13.2 |
| 4.409999999999781 | 4.41 | 8.82 | 13.23 |
| 4.419999999999781 | 4.42 | 8.84 | 13.26 |
| 4.429999999999781 | 4.43 | 8.86 | 13.29 |
| 4.43999999999978 | 4.44 | 8.88 | 13.32 |
| 4.44999999999978 | 4.45 | 8.9 | 13.35 |
| 4.45999999999978 | 4.46 | 8.92 | 13.38 |
| 4.46999999999978 | 4.47 | 8.94 | 13.41 |
| 4.47999999999978 | 4.48 | 8.96 | 13.44 |
| 4.48999999999978 | 4.49 | 8.98 | 13.47 |
| 4.49999999999978 | 4.5 | 9 | 13.5 |
| 4.50999999999978 | 4.51 | 9.02 | 13.53 |
| 4.51999999999978 | 4.52 | 9.04 | 13.56 |
| 4.52999999999978 | 4.53 | 9.06 | 13.59 |
| 4.539999999999778 | 4.54 | 9.08 | 13.62 |
| 4.549999999999778 | 4.55 | 9.1 | 13.65 |
| 4.559999999999778 | 4.56 | 9.12 | 13.68 |
| 4.569999999999778 | 4.57 | 9.14 | 13.71 |
| 4.579999999999778 | 4.58 | 9.16 | 13.74 |
| 4.589999999999777 | 4.59 | 9.18 | 13.77 |
| 4.599999999999777 | 4.6 | 9.2 | 13.8 |
| 4.609999999999777 | 4.61 | 9.22 | 13.83 |
| 4.619999999999777 | 4.62 | 9.24 | 13.86 |
| 4.629999999999777 | 4.63 | 9.26 | 13.89 |
| 4.639999999999776 | 4.64 | 9.28 | 13.92 |
| 4.649999999999776 | 4.65 | 9.3 | 13.95 |
| 4.659999999999776 | 4.66 | 9.32 | 13.98 |
| 4.669999999999776 | 4.67 | 9.34 | 14.01 |
| 4.679999999999775 | 4.68 | 9.36 | 14.04 |
| 4.689999999999775 | 4.69 | 9.38 | 14.07 |
| 4.699999999999775 | 4.7 | 9.4 | 14.1 |
| 4.709999999999775 | 4.71 | 9.42 | 14.13 |
| 4.719999999999774 | 4.72 | 9.44 | 14.16 |
| 4.729999999999774 | 4.73 | 9.46 | 14.19 |
| 4.739999999999774 | 4.74 | 9.48 | 14.22 |
| 4.749999999999774 | 4.75 | 9.5 | 14.25 |
| 4.759999999999774 | 4.76 | 9.52 | 14.28 |
| 4.769999999999774 | 4.77 | 9.54 | 14.31 |
| 4.779999999999773 | 4.78 | 9.56 | 14.34 |
| 4.789999999999773 | 4.79 | 9.58 | 14.37 |
| 4.799999999999773 | 4.8 | 9.6 | 14.4 |
| 4.809999999999773 | 4.81 | 9.62 | 14.43 |
| 4.819999999999773 | 4.82 | 9.64 | 14.46 |
| 4.829999999999773 | 4.83 | 9.66 | 14.49 |
| 4.839999999999772 | 4.84 | 9.68 | 14.52 |
| 4.849999999999772 | 4.85 | 9.7 | 14.55 |
| 4.859999999999772 | 4.86 | 9.72 | 14.58 |
| 4.869999999999772 | 4.87 | 9.74 | 14.61 |
| 4.879999999999771 | 4.88 | 9.76 | 14.64 |
| 4.889999999999771 | 4.89 | 9.78 | 14.67 |
| 4.899999999999771 | 4.9 | 9.8 | 14.7 |
| 4.90999999999977 | 4.91 | 9.82 | 14.73 |
| 4.91999999999977 | 4.92 | 9.84 | 14.76 |
| 4.92999999999977 | 4.93 | 9.86 | 14.79 |
| 4.93999999999977 | 4.94 | 9.88 | 14.82 |
| 4.94999999999977 | 4.95 | 9.9 | 14.85 |
| 4.95999999999977 | 4.96 | 9.92 | 14.88 |
| 4.96999999999977 | 4.97 | 9.94 | 14.91 |
| 4.97999999999977 | 4.98 | 9.96 | 14.94 |
| 4.98999999999977 | 4.99 | 9.98 | 14.97 |
| 4.99999999999977 | 5 | 10 | 15 |
| 5.009999999999768 | 5.01 | 10.02 | 15.03 |
| 5.019999999999768 | 5.02 | 10.04 | 15.06 |
| 5.029999999999768 | 5.03 | 10.06 | 15.09 |
| 5.039999999999768 | 5.04 | 10.08 | 15.12 |
| 5.049999999999767 | 5.05 | 10.1 | 15.15 |
| 5.059999999999767 | 5.06 | 10.12 | 15.18 |
| 5.069999999999767 | 5.07 | 10.14 | 15.21 |
| 5.079999999999767 | 5.08 | 10.16 | 15.24 |
| 5.089999999999767 | 5.09 | 10.18 | 15.27 |
| 5.099999999999766 | 5.1 | 10.2 | 15.3 |
| 5.109999999999766 | 5.11 | 10.22 | 15.33 |
| 5.119999999999766 | 5.12 | 10.24 | 15.36 |
| 5.129999999999766 | 5.13 | 10.26 | 15.39 |
| 5.139999999999766 | 5.14 | 10.28 | 15.42 |
| 5.149999999999765 | 5.15 | 10.3 | 15.45 |
| 5.159999999999765 | 5.16 | 10.32 | 15.48 |
| 5.169999999999765 | 5.17 | 10.34 | 15.51 |
| 5.179999999999765 | 5.18 | 10.36 | 15.54 |
| 5.189999999999764 | 5.19 | 10.38 | 15.57 |
| 5.199999999999764 | 5.2 | 10.4 | 15.6 |
| 5.209999999999764 | 5.21 | 10.42 | 15.63 |
| 5.219999999999764 | 5.22 | 10.44 | 15.66 |
| 5.229999999999764 | 5.23 | 10.46 | 15.69 |
| 5.239999999999763 | 5.24 | 10.48 | 15.72 |
| 5.249999999999763 | 5.25 | 10.5 | 15.75 |
| 5.259999999999763 | 5.26 | 10.52 | 15.78 |
| 5.269999999999763 | 5.27 | 10.54 | 15.81 |
| 5.279999999999763 | 5.28 | 10.56 | 15.84 |
| 5.289999999999762 | 5.29 | 10.58 | 15.87 |
| 5.299999999999762 | 5.3 | 10.6 | 15.9 |
| 5.309999999999762 | 5.31 | 10.62 | 15.93 |
| 5.319999999999762 | 5.32 | 10.64 | 15.96 |
| 5.329999999999762 | 5.33 | 10.66 | 15.99 |
| 5.339999999999761 | 5.34 | 10.68 | 16.02 |
| 5.349999999999761 | 5.35 | 10.7 | 16.05 |
| 5.359999999999761 | 5.36 | 10.72 | 16.08 |
| 5.369999999999761 | 5.37 | 10.74 | 16.11 |
| 5.37999999999976 | 5.38 | 10.76 | 16.14 |
| 5.38999999999976 | 5.39 | 10.78 | 16.17 |
| 5.39999999999976 | 5.4 | 10.8 | 16.2 |
| 5.40999999999976 | 5.41 | 10.82 | 16.23 |
| 5.41999999999976 | 5.42 | 10.84 | 16.26 |
| 5.42999999999976 | 5.43 | 10.86 | 16.29 |
| 5.43999999999976 | 5.44 | 10.88 | 16.32 |
| 5.44999999999976 | 5.45 | 10.9 | 16.35 |
| 5.45999999999976 | 5.46 | 10.92 | 16.38 |
| 5.46999999999976 | 5.47 | 10.94 | 16.41 |
| 5.479999999999758 | 5.48 | 10.96 | 16.44 |
| 5.489999999999758 | 5.49 | 10.98 | 16.47 |
| 5.499999999999758 | 5.5 | 11 | 16.5 |
| 5.509999999999758 | 5.51 | 11.02 | 16.53 |
| 5.519999999999758 | 5.52 | 11.04 | 16.56 |
| 5.529999999999758 | 5.53 | 11.06 | 16.59 |
| 5.539999999999757 | 5.54 | 11.08 | 16.62 |
| 5.549999999999757 | 5.55 | 11.1 | 16.65 |
| 5.559999999999757 | 5.56 | 11.12 | 16.68 |
| 5.569999999999757 | 5.57 | 11.14 | 16.71 |
| 5.579999999999756 | 5.58 | 11.16 | 16.74 |
| 5.589999999999756 | 5.59 | 11.18 | 16.77 |
| 5.599999999999756 | 5.6 | 11.2 | 16.8 |
| 5.609999999999756 | 5.61 | 11.22 | 16.83 |
| 5.619999999999756 | 5.62 | 11.24 | 16.86 |
| 5.629999999999756 | 5.63 | 11.26 | 16.89 |
| 5.639999999999755 | 5.64 | 11.28 | 16.92 |
| 5.649999999999755 | 5.65 | 11.3 | 16.95 |
| 5.659999999999755 | 5.66 | 11.32 | 16.98 |
| 5.669999999999755 | 5.67 | 11.34 | 17.01 |
| 5.679999999999754 | 5.68 | 11.36 | 17.04 |
| 5.689999999999754 | 5.69 | 11.38 | 17.07 |
| 5.699999999999754 | 5.7 | 11.4 | 17.1 |
| 5.709999999999754 | 5.71 | 11.42 | 17.13 |
| 5.719999999999754 | 5.72 | 11.44 | 17.16 |
| 5.729999999999753 | 5.73 | 11.46 | 17.19 |
| 5.739999999999753 | 5.74 | 11.48 | 17.22 |
| 5.749999999999753 | 5.75 | 11.5 | 17.25 |
| 5.759999999999753 | 5.76 | 11.52 | 17.28 |
| 5.769999999999753 | 5.77 | 11.54 | 17.31 |
| 5.779999999999752 | 5.78 | 11.56 | 17.34 |
| 5.789999999999752 | 5.79 | 11.58 | 17.37 |
| 5.799999999999752 | 5.8 | 11.6 | 17.4 |
| 5.809999999999752 | 5.81 | 11.62 | 17.43 |
| 5.819999999999752 | 5.82 | 11.64 | 17.46 |
| 5.829999999999751 | 5.83 | 11.66 | 17.49 |
| 5.839999999999751 | 5.84 | 11.68 | 17.52 |
| 5.849999999999751 | 5.85 | 11.7 | 17.55 |
| 5.859999999999751 | 5.86 | 11.72 | 17.58 |
| 5.86999999999975 | 5.87 | 11.74 | 17.61 |
| 5.87999999999975 | 5.88 | 11.76 | 17.64 |
| 5.88999999999975 | 5.89 | 11.78 | 17.67 |
| 5.89999999999975 | 5.9 | 11.8 | 17.7 |
| 5.90999999999975 | 5.91 | 11.82 | 17.73 |
| 5.91999999999975 | 5.92 | 11.84 | 17.76 |
| 5.92999999999975 | 5.93 | 11.86 | 17.79 |
| 5.93999999999975 | 5.94 | 11.88 | 17.82 |
| 5.949999999999748 | 5.95 | 11.9 | 17.85 |
| 5.959999999999748 | 5.96 | 11.92 | 17.88 |
| 5.969999999999748 | 5.97 | 11.94 | 17.91 |
| 5.979999999999748 | 5.98 | 11.96 | 17.94 |
| 5.989999999999747 | 5.99 | 11.98 | 17.97 |
| 5.999999999999747 | 6 | 12 | 18 |
| 6.009999999999747 | 6.01 | 12.02 | 18.03 |
| 6.019999999999747 | 6.02 | 12.04 | 18.06 |
| 6.029999999999747 | 6.03 | 12.06 | 18.09 |
| 6.039999999999746 | 6.04 | 12.08 | 18.12 |
| 6.049999999999746 | 6.05 | 12.1 | 18.15 |
| 6.059999999999746 | 6.06 | 12.12 | 18.18 |
| 6.069999999999746 | 6.07 | 12.14 | 18.21 |
| 6.079999999999746 | 6.08 | 12.16 | 18.24 |
| 6.089999999999745 | 6.09 | 12.18 | 18.27 |
| 6.099999999999745 | 6.1 | 12.2 | 18.3 |
| 6.109999999999745 | 6.11 | 12.22 | 18.33 |
| 6.119999999999745 | 6.12 | 12.24 | 18.36 |
| 6.129999999999745 | 6.13 | 12.26 | 18.39 |
| 6.139999999999744 | 6.14 | 12.28 | 18.42 |
| 6.149999999999744 | 6.15 | 12.3 | 18.45 |
| 6.159999999999744 | 6.16 | 12.32 | 18.48 |
| 6.169999999999744 | 6.17 | 12.34 | 18.51 |
| 6.179999999999744 | 6.18 | 12.36 | 18.54 |
| 6.189999999999744 | 6.19 | 12.38 | 18.57 |
| 6.199999999999743 | 6.2 | 12.4 | 18.6 |
| 6.209999999999743 | 6.21 | 12.42 | 18.63 |
| 6.219999999999743 | 6.22 | 12.44 | 18.66 |
| 6.229999999999743 | 6.23 | 12.46 | 18.69 |
| 6.239999999999742 | 6.24 | 12.48 | 18.72 |
| 6.249999999999742 | 6.25 | 12.5 | 18.75 |
| 6.259999999999742 | 6.26 | 12.52 | 18.78 |
| 6.269999999999742 | 6.27 | 12.54 | 18.81 |
| 6.279999999999741 | 6.28 | 12.56 | 18.84 |
| 6.289999999999741 | 6.29 | 12.58 | 18.87 |
| 6.299999999999741 | 6.3 | 12.6 | 18.9 |
| 6.309999999999741 | 6.31 | 12.62 | 18.93 |
| 6.319999999999741 | 6.32 | 12.64 | 18.96 |
| 6.329999999999741 | 6.33 | 12.66 | 18.99 |
| 6.33999999999974 | 6.34 | 12.68 | 19.02 |
| 6.34999999999974 | 6.35 | 12.7 | 19.05 |
| 6.35999999999974 | 6.36 | 12.72 | 19.08 |
| 6.36999999999974 | 6.37 | 12.74 | 19.11 |
| 6.37999999999974 | 6.38 | 12.76 | 19.14 |
| 6.38999999999974 | 6.39 | 12.78 | 19.17 |
| 6.39999999999974 | 6.4 | 12.8 | 19.2 |
| 6.409999999999738 | 6.41 | 12.82 | 19.23 |
| 6.419999999999738 | 6.42 | 12.84 | 19.26 |
| 6.429999999999738 | 6.43 | 12.86 | 19.29 |
| 6.439999999999738 | 6.44 | 12.88 | 19.32 |
| 6.449999999999738 | 6.45 | 12.9 | 19.35 |
| 6.459999999999737 | 6.46 | 12.92 | 19.38 |
| 6.469999999999737 | 6.47 | 12.94 | 19.41 |
| 6.479999999999737 | 6.48 | 12.96 | 19.44 |
| 6.489999999999737 | 6.49 | 12.98 | 19.47 |
| 6.499999999999737 | 6.5 | 13 | 19.5 |
| 6.509999999999736 | 6.51 | 13.02 | 19.53 |
| 6.519999999999736 | 6.52 | 13.04 | 19.56 |
| 6.529999999999736 | 6.53 | 13.06 | 19.59 |
| 6.539999999999736 | 6.54 | 13.08 | 19.62 |
| 6.549999999999736 | 6.55 | 13.1 | 19.65 |
| 6.559999999999735 | 6.56 | 13.12 | 19.68 |
| 6.569999999999735 | 6.57 | 13.14 | 19.71 |
| 6.579999999999735 | 6.58 | 13.16 | 19.74 |
| 6.589999999999735 | 6.59 | 13.18 | 19.77 |
| 6.599999999999734 | 6.6 | 13.2 | 19.8 |
| 6.609999999999734 | 6.61 | 13.22 | 19.83 |
| 6.619999999999734 | 6.62 | 13.24 | 19.86 |
| 6.629999999999734 | 6.63 | 13.26 | 19.89 |
| 6.639999999999734 | 6.64 | 13.28 | 19.92 |
| 6.649999999999734 | 6.65 | 13.3 | 19.95 |
| 6.659999999999734 | 6.66 | 13.32 | 19.98 |
| 6.669999999999733 | 6.67 | 13.34 | 20.01 |
| 6.679999999999733 | 6.68 | 13.36 | 20.04 |
| 6.689999999999733 | 6.69 | 13.38 | 20.07 |
| 6.699999999999733 | 6.7 | 13.4 | 20.1 |
| 6.709999999999732 | 6.71 | 13.42 | 20.13 |
| 6.719999999999732 | 6.72 | 13.44 | 20.16 |
| 6.729999999999732 | 6.73 | 13.46 | 20.19 |
| 6.739999999999731 | 6.74 | 13.48 | 20.22 |
| 6.749999999999731 | 6.75 | 13.5 | 20.25 |
| 6.759999999999731 | 6.76 | 13.52 | 20.28 |
| 6.769999999999731 | 6.77 | 13.54 | 20.31 |
| 6.77999999999973 | 6.78 | 13.56 | 20.34 |
| 6.78999999999973 | 6.79 | 13.58 | 20.37 |
| 6.79999999999973 | 6.8 | 13.6 | 20.4 |
| 6.80999999999973 | 6.81 | 13.62 | 20.43 |
| 6.81999999999973 | 6.82 | 13.64 | 20.46 |
| 6.82999999999973 | 6.83 | 13.66 | 20.49 |
| 6.83999999999973 | 6.84 | 13.68 | 20.52 |
| 6.84999999999973 | 6.85 | 13.7 | 20.55 |
| 6.85999999999973 | 6.86 | 13.72 | 20.58 |
| 6.86999999999973 | 6.87 | 13.74 | 20.61 |
| 6.879999999999728 | 6.88 | 13.76 | 20.64 |
| 6.889999999999728 | 6.89 | 13.78 | 20.67 |
| 6.899999999999728 | 6.9 | 13.8 | 20.7 |
| 6.909999999999728 | 6.91 | 13.82 | 20.73 |
| 6.919999999999728 | 6.92 | 13.84 | 20.76 |
| 6.929999999999727 | 6.93 | 13.86 | 20.79 |
| 6.939999999999727 | 6.94 | 13.88 | 20.82 |
| 6.949999999999727 | 6.95 | 13.9 | 20.85 |
| 6.959999999999727 | 6.96 | 13.92 | 20.88 |
| 6.969999999999727 | 6.97 | 13.94 | 20.91 |
| 6.979999999999726 | 6.98 | 13.96 | 20.94 |
| 6.989999999999726 | 6.99 | 13.98 | 20.97 |
| 6.999999999999726 | 7 | 14 | 21 |
| 7.009999999999726 | 7.01 | 14.02 | 21.03 |
| 7.019999999999726 | 7.02 | 14.04 | 21.06 |
| 7.029999999999725 | 7.03 | 14.06 | 21.09 |
| 7.039999999999725 | 7.04 | 14.08 | 21.12 |
| 7.049999999999725 | 7.05 | 14.1 | 21.15 |
| 7.059999999999725 | 7.06 | 14.12 | 21.18 |
| 7.069999999999724 | 7.07 | 14.14 | 21.21 |
| 7.079999999999724 | 7.08 | 14.16 | 21.24 |
| 7.089999999999724 | 7.09 | 14.18 | 21.27 |
| 7.099999999999724 | 7.1 | 14.2 | 21.3 |
| 7.109999999999724 | 7.11 | 14.22 | 21.33 |
| 7.119999999999724 | 7.12 | 14.24 | 21.36 |
| 7.129999999999724 | 7.13 | 14.26 | 21.39 |
| 7.139999999999723 | 7.14 | 14.28 | 21.42 |
| 7.149999999999723 | 7.15 | 14.3 | 21.45 |
| 7.159999999999723 | 7.16 | 14.32 | 21.48 |
| 7.169999999999723 | 7.17 | 14.34 | 21.51 |
| 7.179999999999722 | 7.18 | 14.36 | 21.54 |
| 7.189999999999722 | 7.19 | 14.38 | 21.57 |
| 7.199999999999722 | 7.2 | 14.4 | 21.6 |
| 7.209999999999721 | 7.21 | 14.42 | 21.63 |
| 7.219999999999721 | 7.22 | 14.44 | 21.66 |
| 7.229999999999721 | 7.23 | 14.46 | 21.69 |
| 7.23999999999972 | 7.24 | 14.48 | 21.72 |
| 7.24999999999972 | 7.25 | 14.5 | 21.75 |
| 7.25999999999972 | 7.26 | 14.52 | 21.78 |
| 7.26999999999972 | 7.27 | 14.54 | 21.81 |
| 7.27999999999972 | 7.28 | 14.56 | 21.84 |
| 7.28999999999972 | 7.29 | 14.58 | 21.87 |
| 7.29999999999972 | 7.3 | 14.6 | 21.9 |
| 7.30999999999972 | 7.31 | 14.62 | 21.93 |
| 7.31999999999972 | 7.32 | 14.64 | 21.96 |
| 7.329999999999719 | 7.33 | 14.66 | 21.99 |
| 7.33999999999972 | 7.34 | 14.68 | 22.02 |
| 7.349999999999719 | 7.35 | 14.7 | 22.05 |
| 7.359999999999719 | 7.36 | 14.72 | 22.08 |
| 7.369999999999718 | 7.37 | 14.74 | 22.11 |
| 7.379999999999718 | 7.38 | 14.76 | 22.14 |
| 7.389999999999718 | 7.39 | 14.78 | 22.17 |
| 7.399999999999718 | 7.4 | 14.8 | 22.2 |
| 7.409999999999717 | 7.41 | 14.82 | 22.23 |
| 7.419999999999717 | 7.42 | 14.84 | 22.26 |
| 7.429999999999717 | 7.43 | 14.86 | 22.29 |
| 7.439999999999717 | 7.44 | 14.88 | 22.32 |
| 7.449999999999716 | 7.45 | 14.9 | 22.35 |
| 7.459999999999716 | 7.46 | 14.92 | 22.38 |
| 7.469999999999716 | 7.47 | 14.94 | 22.41 |
| 7.479999999999716 | 7.48 | 14.96 | 22.44 |
| 7.489999999999715 | 7.49 | 14.98 | 22.47 |
| 7.499999999999715 | 7.5 | 15 | 22.5 |
| 7.509999999999715 | 7.51 | 15.02 | 22.53 |
| 7.519999999999715 | 7.52 | 15.04 | 22.56 |
| 7.529999999999715 | 7.53 | 15.06 | 22.59 |
| 7.539999999999714 | 7.54 | 15.08 | 22.62 |
| 7.549999999999714 | 7.55 | 15.1 | 22.65 |
| 7.559999999999714 | 7.56 | 15.12 | 22.68 |
| 7.569999999999714 | 7.57 | 15.14 | 22.71 |
| 7.579999999999714 | 7.58 | 15.16 | 22.74 |
| 7.589999999999714 | 7.59 | 15.18 | 22.77 |
| 7.599999999999714 | 7.6 | 15.2 | 22.8 |
| 7.609999999999713 | 7.61 | 15.22 | 22.83 |
| 7.619999999999713 | 7.62 | 15.24 | 22.86 |
| 7.629999999999713 | 7.63 | 15.26 | 22.89 |
| 7.639999999999713 | 7.64 | 15.28 | 22.92 |
| 7.649999999999712 | 7.65 | 15.3 | 22.95 |
| 7.659999999999712 | 7.66 | 15.32 | 22.98 |
| 7.669999999999712 | 7.67 | 15.34 | 23.01 |
| 7.679999999999712 | 7.68 | 15.36 | 23.04 |
| 7.689999999999712 | 7.69 | 15.38 | 23.07 |
| 7.699999999999711 | 7.7 | 15.4 | 23.1 |
| 7.709999999999711 | 7.71 | 15.42 | 23.13 |
| 7.719999999999711 | 7.72 | 15.44 | 23.16 |
| 7.729999999999711 | 7.73 | 15.46 | 23.19 |
| 7.73999999999971 | 7.74 | 15.48 | 23.22 |
| 7.74999999999971 | 7.75 | 15.5 | 23.25 |
| 7.75999999999971 | 7.76 | 15.52 | 23.28 |
| 7.76999999999971 | 7.77 | 15.54 | 23.31 |
| 7.77999999999971 | 7.78 | 15.56 | 23.34 |
| 7.78999999999971 | 7.79 | 15.58 | 23.37 |
| 7.79999999999971 | 7.8 | 15.6 | 23.4 |
| 7.80999999999971 | 7.81 | 15.62 | 23.43 |
| 7.819999999999709 | 7.82 | 15.64 | 23.46 |
| 7.829999999999709 | 7.83 | 15.66 | 23.49 |
| 7.839999999999708 | 7.84 | 15.68 | 23.52 |
| 7.849999999999708 | 7.85 | 15.7 | 23.55 |
| 7.859999999999708 | 7.86 | 15.72 | 23.58 |
| 7.869999999999708 | 7.87 | 15.74 | 23.61 |
| 7.879999999999707 | 7.88 | 15.76 | 23.64 |
| 7.889999999999707 | 7.89 | 15.78 | 23.67 |
| 7.899999999999707 | 7.9 | 15.8 | 23.7 |
| 7.909999999999707 | 7.91 | 15.82 | 23.73 |
| 7.919999999999706 | 7.92 | 15.84 | 23.76 |
| 7.929999999999706 | 7.93 | 15.86 | 23.79 |
| 7.939999999999706 | 7.94 | 15.88 | 23.82 |
| 7.949999999999706 | 7.95 | 15.9 | 23.85 |
| 7.959999999999705 | 7.96 | 15.92 | 23.88 |
| 7.969999999999705 | 7.97 | 15.94 | 23.91 |
| 7.979999999999705 | 7.98 | 15.96 | 23.94 |
| 7.989999999999705 | 7.99 | 15.98 | 23.97 |
| 7.999999999999705 | 8 | 16 | 24 |
| 8.009999999999703 | 8.01 | 16.02 | 24.03 |
| 8.019999999999705 | 8.02 | 16.04 | 24.06 |
| 8.029999999999704 | 8.03 | 16.06 | 24.09 |
| 8.039999999999704 | 8.04 | 16.08 | 24.12 |
| 8.049999999999704 | 8.05 | 16.1 | 24.15 |
| 8.059999999999704 | 8.06 | 16.12 | 24.18 |
| 8.069999999999704 | 8.07 | 16.14 | 24.21 |
| 8.079999999999703 | 8.08 | 16.16 | 24.24 |
| 8.089999999999703 | 8.09 | 16.18 | 24.27 |
| 8.099999999999701 | 8.1 | 16.2 | 24.3 |
| 8.109999999999703 | 8.11 | 16.22 | 24.33 |
| 8.119999999999703 | 8.12 | 16.24 | 24.36 |
| 8.129999999999702 | 8.13 | 16.26 | 24.39 |
| 8.139999999999702 | 8.14 | 16.28 | 24.42 |
| 8.1499999999997 | 8.15 | 16.3 | 24.45 |
| 8.1599999999997 | 8.16 | 16.32 | 24.48 |
| 8.1699999999997 | 8.17 | 16.34 | 24.51 |
| 8.1799999999997 | 8.18 | 16.36 | 24.54 |
| 8.1899999999997 | 8.19 | 16.38 | 24.57 |
| 8.1999999999997 | 8.2 | 16.4 | 24.6 |
| 8.2099999999997 | 8.21 | 16.42 | 24.63 |
| 8.2199999999997 | 8.22 | 16.44 | 24.66 |
| 8.2299999999997 | 8.23 | 16.46 | 24.69 |
| 8.2399999999997 | 8.24 | 16.48 | 24.72 |
| 8.2499999999997 | 8.25 | 16.5 | 24.75 |
| 8.2599999999997 | 8.26 | 16.52 | 24.78 |
| 8.2699999999997 | 8.27 | 16.54 | 24.81 |
| 8.2799999999997 | 8.28 | 16.56 | 24.84 |
| 8.289999999999697 | 8.29 | 16.58 | 24.87 |
| 8.299999999999699 | 8.3 | 16.6 | 24.9 |
| 8.309999999999699 | 8.31 | 16.62 | 24.93 |
| 8.319999999999698 | 8.32 | 16.64 | 24.96 |
| 8.329999999999698 | 8.33 | 16.66 | 24.99 |
| 8.339999999999698 | 8.34 | 16.68 | 25.02 |
| 8.349999999999698 | 8.35 | 16.7 | 25.05 |
| 8.359999999999697 | 8.36 | 16.72 | 25.08 |
| 8.369999999999697 | 8.37 | 16.74 | 25.11 |
| 8.379999999999695 | 8.38 | 16.76 | 25.14 |
| 8.389999999999697 | 8.39 | 16.78 | 25.17 |
| 8.399999999999697 | 8.4 | 16.8 | 25.2 |
| 8.409999999999696 | 8.41 | 16.82 | 25.23 |
| 8.419999999999696 | 8.42 | 16.84 | 25.26 |
| 8.429999999999694 | 8.43 | 16.86 | 25.29 |
| 8.439999999999696 | 8.44 | 16.88 | 25.32 |
| 8.449999999999696 | 8.45 | 16.9 | 25.35 |
| 8.459999999999695 | 8.46 | 16.92 | 25.38 |
| 8.469999999999695 | 8.47 | 16.94 | 25.41 |
| 8.479999999999693 | 8.48 | 16.96 | 25.44 |
| 8.489999999999695 | 8.49 | 16.98 | 25.47 |
| 8.499999999999694 | 8.5 | 17 | 25.5 |
| 8.509999999999694 | 8.51 | 17.02 | 25.53 |
| 8.519999999999694 | 8.52 | 17.04 | 25.56 |
| 8.529999999999694 | 8.53 | 17.06 | 25.59 |
| 8.539999999999694 | 8.54 | 17.08 | 25.62 |
| 8.549999999999693 | 8.55 | 17.1 | 25.65 |
| 8.55999999999969 | 8.56 | 17.12 | 25.68 |
| 8.56999999999969 | 8.57 | 17.14 | 25.71 |
| 8.57999999999969 | 8.58 | 17.16 | 25.74 |
| 8.58999999999969 | 8.59 | 17.18 | 25.77 |
| 8.59999999999969 | 8.6 | 17.2 | 25.8 |
| 8.60999999999969 | 8.61 | 17.22 | 25.83 |
| 8.61999999999969 | 8.62 | 17.24 | 25.86 |
| 8.62999999999969 | 8.63 | 17.26 | 25.89 |
| 8.63999999999969 | 8.64 | 17.28 | 25.92 |
| 8.64999999999969 | 8.65 | 17.3 | 25.95 |
| 8.65999999999969 | 8.66 | 17.32 | 25.98 |
| 8.66999999999969 | 8.67 | 17.34 | 26.01 |
| 8.67999999999969 | 8.68 | 17.36 | 26.04 |
| 8.68999999999969 | 8.69 | 17.38 | 26.07 |
| 8.69999999999969 | 8.7 | 17.4 | 26.1 |
| 8.70999999999969 | 8.71 | 17.42 | 26.13 |
| 8.71999999999969 | 8.72 | 17.44 | 26.16 |
| 8.72999999999969 | 8.73 | 17.46 | 26.19 |
| 8.73999999999969 | 8.74 | 17.48 | 26.22 |
| 8.74999999999969 | 8.75 | 17.5 | 26.25 |
| 8.759999999999687 | 8.76 | 17.52 | 26.28 |
| 8.769999999999689 | 8.77 | 17.54 | 26.31 |
| 8.779999999999688 | 8.78 | 17.56 | 26.34 |
| 8.789999999999688 | 8.79 | 17.58 | 26.37 |
| 8.799999999999686 | 8.8 | 17.6 | 26.4 |
| 8.809999999999688 | 8.81 | 17.62 | 26.43 |
| 8.819999999999688 | 8.82 | 17.64 | 26.46 |
| 8.829999999999687 | 8.83 | 17.66 | 26.49 |
| 8.839999999999687 | 8.84 | 17.68 | 26.52 |
| 8.849999999999685 | 8.85 | 17.7 | 26.55 |
| 8.859999999999687 | 8.86 | 17.72 | 26.58 |
| 8.869999999999687 | 8.87 | 17.74 | 26.61 |
| 8.879999999999686 | 8.88 | 17.76 | 26.64 |
| 8.889999999999686 | 8.89 | 17.78 | 26.67 |
| 8.899999999999684 | 8.9 | 17.8 | 26.7 |
| 8.909999999999686 | 8.91 | 17.82 | 26.73 |
| 8.919999999999686 | 8.92 | 17.84 | 26.76 |
| 8.929999999999685 | 8.93 | 17.86 | 26.79 |
| 8.939999999999685 | 8.94 | 17.88 | 26.82 |
| 8.949999999999685 | 8.95 | 17.9 | 26.85 |
| 8.959999999999685 | 8.96 | 17.92 | 26.88 |
| 8.969999999999684 | 8.97 | 17.94 | 26.91 |
| 8.979999999999684 | 8.98 | 17.96 | 26.94 |
| 8.989999999999682 | 8.99 | 17.98 | 26.97 |
| 8.999999999999684 | 9 | 18 | 27 |
| 9.009999999999684 | 9.01 | 18.02 | 27.03 |
| 9.019999999999683 | 9.02 | 18.04 | 27.06 |
| 9.029999999999683 | 9.03 | 18.06 | 27.09 |
| 9.039999999999681 | 9.04 | 18.08 | 27.12 |
| 9.049999999999683 | 9.05 | 18.1 | 27.15 |
| 9.05999999999968 | 9.06 | 18.12 | 27.18 |
| 9.06999999999968 | 9.07 | 18.14 | 27.21 |
| 9.07999999999968 | 9.08 | 18.16 | 27.24 |
| 9.08999999999968 | 9.09 | 18.18 | 27.27 |
| 9.09999999999968 | 9.1 | 18.2 | 27.3 |
| 9.10999999999968 | 9.11 | 18.22 | 27.33 |
| 9.11999999999968 | 9.12 | 18.24 | 27.36 |
| 9.12999999999968 | 9.13 | 18.26 | 27.39 |
| 9.13999999999968 | 9.14 | 18.28 | 27.42 |
| 9.14999999999968 | 9.15 | 18.3 | 27.45 |
| 9.15999999999968 | 9.16 | 18.32 | 27.48 |
| 9.16999999999968 | 9.17 | 18.34 | 27.51 |
| 9.17999999999968 | 9.18 | 18.36 | 27.54 |
| 9.18999999999968 | 9.19 | 18.38 | 27.57 |
| 9.19999999999968 | 9.2 | 18.4 | 27.6 |
| 9.20999999999968 | 9.21 | 18.42 | 27.63 |
| 9.21999999999968 | 9.22 | 18.44 | 27.66 |
| 9.229999999999677 | 9.23 | 18.46 | 27.69 |
| 9.239999999999679 | 9.24 | 18.48 | 27.72 |
| 9.249999999999678 | 9.25 | 18.5 | 27.75 |
| 9.259999999999678 | 9.26 | 18.52 | 27.78 |
| 9.269999999999678 | 9.27 | 18.54 | 27.81 |
| 9.279999999999678 | 9.28 | 18.56 | 27.84 |
| 9.289999999999678 | 9.29 | 18.58 | 27.87 |
| 9.299999999999677 | 9.3 | 18.6 | 27.9 |
| 9.309999999999677 | 9.31 | 18.62 | 27.93 |
| 9.319999999999675 | 9.32 | 18.64 | 27.96 |
| 9.329999999999677 | 9.33 | 18.66 | 27.99 |
| 9.339999999999677 | 9.34 | 18.68 | 28.02 |
| 9.349999999999676 | 9.35 | 18.7 | 28.05 |
| 9.359999999999676 | 9.36 | 18.72 | 28.08 |
| 9.369999999999674 | 9.37 | 18.74 | 28.11 |
| 9.379999999999676 | 9.38 | 18.76 | 28.14 |
| 9.389999999999675 | 9.39 | 18.78 | 28.17 |
| 9.399999999999675 | 9.4 | 18.8 | 28.2 |
| 9.409999999999675 | 9.41 | 18.82 | 28.23 |
| 9.419999999999675 | 9.42 | 18.84 | 28.26 |
| 9.429999999999675 | 9.43 | 18.86 | 28.29 |
| 9.439999999999674 | 9.44 | 18.88 | 28.32 |
| 9.449999999999674 | 9.45 | 18.9 | 28.35 |
| 9.459999999999672 | 9.46 | 18.92 | 28.38 |
| 9.469999999999674 | 9.47 | 18.94 | 28.41 |
| 9.479999999999674 | 9.48 | 18.96 | 28.44 |
| 9.489999999999673 | 9.49 | 18.98 | 28.47 |
| 9.499999999999673 | 9.5 | 19 | 28.5 |
| 9.509999999999671 | 9.51 | 19.02 | 28.53 |
| 9.519999999999673 | 9.52 | 19.04 | 28.56 |
| 9.529999999999673 | 9.53 | 19.06 | 28.59 |
| 9.539999999999672 | 9.54 | 19.08 | 28.62 |
| 9.549999999999672 | 9.55 | 19.1 | 28.65 |
| 9.55999999999967 | 9.56 | 19.12 | 28.68 |
| 9.56999999999967 | 9.57 | 19.14 | 28.71 |
| 9.57999999999967 | 9.58 | 19.16 | 28.74 |
| 9.58999999999967 | 9.59 | 19.18 | 28.77 |
| 9.59999999999967 | 9.6 | 19.2 | 28.8 |
| 9.60999999999967 | 9.61 | 19.22 | 28.83 |
| 9.61999999999967 | 9.62 | 19.24 | 28.86 |
| 9.62999999999967 | 9.63 | 19.26 | 28.89 |
| 9.63999999999967 | 9.64 | 19.28 | 28.92 |
| 9.64999999999967 | 9.65 | 19.3 | 28.95 |
| 9.65999999999967 | 9.66 | 19.32 | 28.98 |
| 9.66999999999967 | 9.67 | 19.34 | 29.01 |
| 9.67999999999967 | 9.68 | 19.36 | 29.04 |
| 9.689999999999667 | 9.69 | 19.38 | 29.07 |
| 9.699999999999669 | 9.7 | 19.4 | 29.1 |
| 9.709999999999669 | 9.71 | 19.42 | 29.13 |
| 9.719999999999668 | 9.72 | 19.44 | 29.16 |
| 9.729999999999668 | 9.73 | 19.46 | 29.19 |
| 9.739999999999666 | 9.74 | 19.48 | 29.22 |
| 9.749999999999668 | 9.75 | 19.5 | 29.25 |
| 9.759999999999668 | 9.76 | 19.52 | 29.28 |
| 9.769999999999667 | 9.77 | 19.54 | 29.31 |
| 9.779999999999667 | 9.78 | 19.56 | 29.34 |
| 9.789999999999665 | 9.79 | 19.58 | 29.37 |
| 9.799999999999667 | 9.8 | 19.6 | 29.4 |
| 9.809999999999667 | 9.81 | 19.62 | 29.43 |
| 9.819999999999666 | 9.82 | 19.64 | 29.46 |
| 9.829999999999666 | 9.83 | 19.66 | 29.49 |
| 9.839999999999664 | 9.84 | 19.68 | 29.52 |
| 9.849999999999666 | 9.85 | 19.7 | 29.55 |
| 9.859999999999665 | 9.86 | 19.72 | 29.58 |
| 9.869999999999665 | 9.87 | 19.74 | 29.61 |
| 9.879999999999663 | 9.88 | 19.76 | 29.64 |
| 9.889999999999665 | 9.89 | 19.78 | 29.67 |
| 9.899999999999665 | 9.9 | 19.8 | 29.7 |
| 9.909999999999664 | 9.91 | 19.82 | 29.73 |
| 9.919999999999664 | 9.92 | 19.84 | 29.76 |
| 9.929999999999662 | 9.93 | 19.86 | 29.79 |
| 9.939999999999664 | 9.94 | 19.88 | 29.82 |
| 9.949999999999664 | 9.95 | 19.9 | 29.85 |
| 9.95999999999966 | 9.96 | 19.92 | 29.88 |
| 9.96999999999966 | 9.97 | 19.94 | 29.91 |
| 9.97999999999966 | 9.98 | 19.96 | 29.94 |
| 9.98999999999966 | 9.99 | 19.98 | 29.97 |
| 9.99999999999966 | 10 | 20 | 30 |